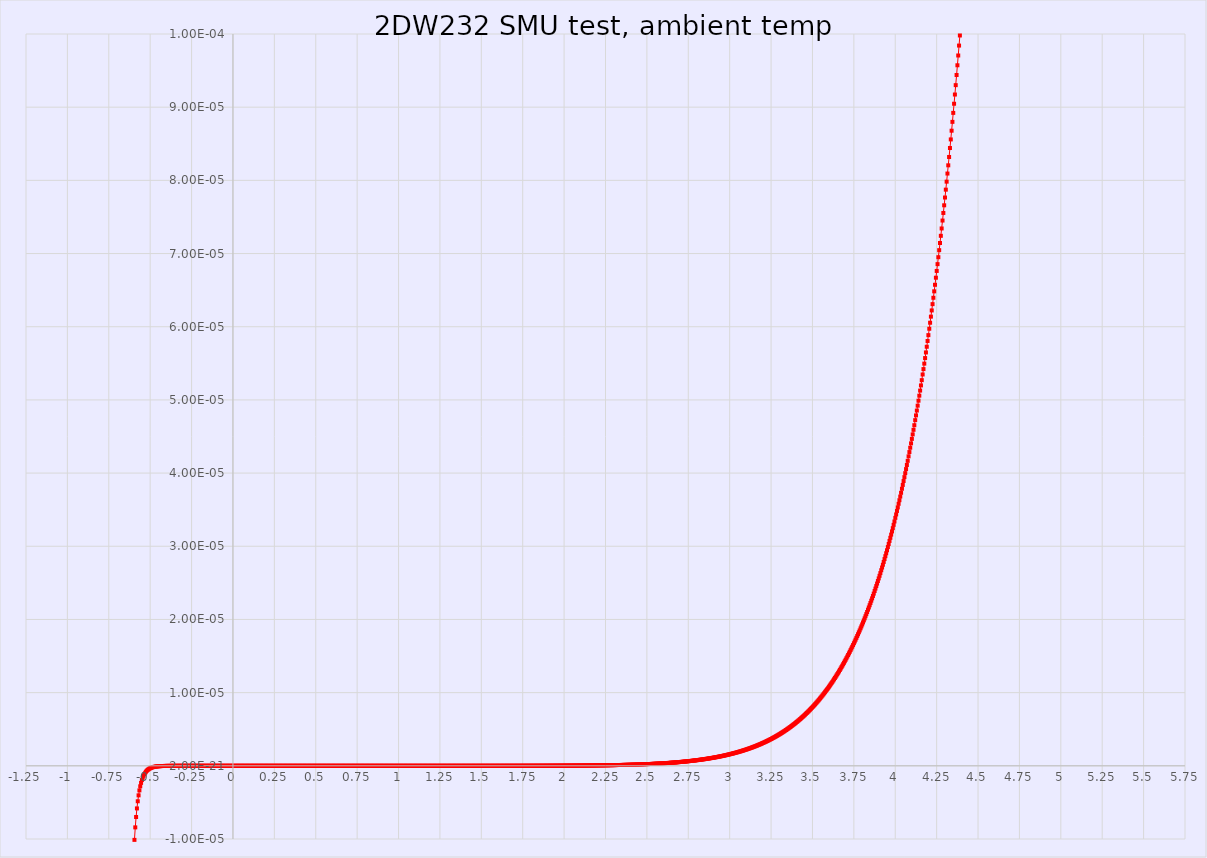
| Category | Series 0 |
|---|---|
| -0.812044 | -0.02 |
| -0.812034 | -0.02 |
| -0.81202 | -0.02 |
| -0.81203 | -0.02 |
| -0.812037 | -0.02 |
| -0.812029 | -0.02 |
| -0.81202 | -0.02 |
| -0.812019 | -0.02 |
| -0.812015 | -0.02 |
| -0.812009 | -0.02 |
| -0.812006 | -0.02 |
| -0.812006 | -0.02 |
| -0.812 | -0.02 |
| -0.811991 | -0.02 |
| -0.811995 | -0.02 |
| -0.811985 | -0.02 |
| -0.811979 | -0.02 |
| -0.811966 | -0.02 |
| -0.811964 | -0.02 |
| -0.811967 | -0.02 |
| -0.811957 | -0.02 |
| -0.811958 | -0.02 |
| -0.811951 | -0.02 |
| -0.811951 | -0.02 |
| -0.811946 | -0.02 |
| -0.811942 | -0.02 |
| -0.811942 | -0.02 |
| -0.811939 | -0.02 |
| -0.811934 | -0.02 |
| -0.811934 | -0.02 |
| -0.811929 | -0.02 |
| -0.811924 | -0.02 |
| -0.811926 | -0.02 |
| -0.811918 | -0.02 |
| -0.811916 | -0.02 |
| -0.811914 | -0.02 |
| -0.811904 | -0.02 |
| -0.811902 | -0.02 |
| -0.811893 | -0.02 |
| -0.811899 | -0.02 |
| -0.811892 | -0.02 |
| -0.811898 | -0.02 |
| -0.811895 | -0.02 |
| -0.811903 | -0.02 |
| -0.811891 | -0.02 |
| -0.811897 | -0.02 |
| -0.81189 | -0.02 |
| -0.81189 | -0.02 |
| -0.811886 | -0.02 |
| -0.811882 | -0.02 |
| -0.811879 | -0.02 |
| -0.81188 | -0.02 |
| -0.811876 | -0.02 |
| -0.811867 | -0.02 |
| -0.811857 | -0.02 |
| -0.811847 | -0.02 |
| -0.811858 | -0.02 |
| -0.81186 | -0.02 |
| -0.811858 | -0.02 |
| -0.811843 | -0.02 |
| -0.811852 | -0.02 |
| -0.811848 | -0.02 |
| -0.811845 | -0.02 |
| -0.811841 | -0.02 |
| -0.811819 | -0.02 |
| -0.811835 | -0.02 |
| -0.811845 | -0.02 |
| -0.811831 | -0.02 |
| -0.811834 | -0.02 |
| -0.811821 | -0.02 |
| -0.811821 | -0.02 |
| -0.811827 | -0.02 |
| -0.811806 | -0.02 |
| -0.811803 | -0.02 |
| -0.811808 | -0.02 |
| -0.811782 | -0.02 |
| -0.811775 | -0.02 |
| -0.811789 | -0.02 |
| -0.81179 | -0.02 |
| -0.811773 | -0.02 |
| -0.811769 | -0.02 |
| -0.811761 | -0.02 |
| -0.811759 | -0.02 |
| -0.811751 | -0.02 |
| -0.811757 | -0.02 |
| -0.811748 | -0.02 |
| -0.811746 | -0.02 |
| -0.81174 | -0.02 |
| -0.811735 | -0.02 |
| -0.811734 | -0.02 |
| -0.811723 | -0.02 |
| -0.811723 | -0.02 |
| -0.811722 | -0.02 |
| -0.811719 | -0.02 |
| -0.811712 | -0.02 |
| -0.811725 | -0.02 |
| -0.811718 | -0.02 |
| -0.811716 | -0.02 |
| -0.811719 | -0.02 |
| -0.811723 | -0.02 |
| -0.811723 | -0.02 |
| -0.811724 | -0.02 |
| -0.811731 | -0.02 |
| -0.811749 | -0.02 |
| -0.811738 | -0.02 |
| -0.811737 | -0.02 |
| -0.811732 | -0.02 |
| -0.811744 | -0.02 |
| -0.811734 | -0.02 |
| -0.811741 | -0.02 |
| -0.811724 | -0.02 |
| -0.811729 | -0.02 |
| -0.811726 | -0.02 |
| -0.811721 | -0.02 |
| -0.811725 | -0.02 |
| -0.811714 | -0.02 |
| -0.811728 | -0.02 |
| -0.811724 | -0.02 |
| -0.81172 | -0.02 |
| -0.811721 | -0.02 |
| -0.811723 | -0.02 |
| -0.811733 | -0.02 |
| -0.811728 | -0.02 |
| -0.811723 | -0.02 |
| -0.81171 | -0.02 |
| -0.811712 | -0.02 |
| -0.811715 | -0.02 |
| -0.811703 | -0.02 |
| -0.811701 | -0.02 |
| -0.811701 | -0.02 |
| -0.811697 | -0.02 |
| -0.811695 | -0.02 |
| -0.8117 | -0.02 |
| -0.811692 | -0.02 |
| -0.811685 | -0.02 |
| -0.811681 | -0.02 |
| -0.811682 | -0.02 |
| -0.811681 | -0.02 |
| -0.811682 | -0.02 |
| -0.811674 | -0.02 |
| -0.811667 | -0.02 |
| -0.811679 | -0.02 |
| -0.811664 | -0.02 |
| -0.811659 | -0.02 |
| -0.811659 | -0.02 |
| -0.811654 | -0.02 |
| -0.811659 | -0.02 |
| -0.811643 | -0.02 |
| -0.811645 | -0.02 |
| -0.811646 | -0.02 |
| -0.811647 | -0.02 |
| -0.811636 | -0.02 |
| -0.811643 | -0.02 |
| -0.811651 | -0.02 |
| -0.811641 | -0.02 |
| -0.811645 | -0.02 |
| -0.811647 | -0.02 |
| -0.811641 | -0.02 |
| -0.811642 | -0.02 |
| -0.811629 | -0.02 |
| -0.811629 | -0.02 |
| -0.811632 | -0.02 |
| -0.811637 | -0.02 |
| -0.811625 | -0.02 |
| -0.811626 | -0.02 |
| -0.81162 | -0.02 |
| -0.811629 | -0.02 |
| -0.811634 | -0.02 |
| -0.811625 | -0.02 |
| -0.811618 | -0.02 |
| -0.811612 | -0.02 |
| -0.811614 | -0.02 |
| -0.811611 | -0.02 |
| -0.811617 | -0.02 |
| -0.811626 | -0.02 |
| -0.811617 | -0.02 |
| -0.811618 | -0.02 |
| -0.811616 | -0.02 |
| -0.811627 | -0.02 |
| -0.811617 | -0.02 |
| -0.811624 | -0.02 |
| -0.811621 | -0.02 |
| -0.811628 | -0.02 |
| -0.811631 | -0.02 |
| -0.811634 | -0.02 |
| -0.811645 | -0.02 |
| -0.811653 | -0.02 |
| -0.811655 | -0.02 |
| -0.811667 | -0.02 |
| -0.811682 | -0.02 |
| -0.811702 | -0.02 |
| -0.811709 | -0.02 |
| -0.811729 | -0.02 |
| -0.811751 | -0.02 |
| -0.811752 | -0.02 |
| -0.811766 | -0.02 |
| -0.811775 | -0.02 |
| -0.811779 | -0.02 |
| -0.811782 | -0.02 |
| -0.811792 | -0.02 |
| -0.811805 | -0.02 |
| -0.81182 | -0.02 |
| -0.811823 | -0.02 |
| -0.811828 | -0.02 |
| -0.811843 | -0.02 |
| -0.811853 | -0.02 |
| -0.811859 | -0.02 |
| -0.811866 | -0.02 |
| -0.811879 | -0.02 |
| -0.811877 | -0.02 |
| -0.811869 | -0.02 |
| -0.811875 | -0.02 |
| -0.811878 | -0.02 |
| -0.811878 | -0.02 |
| -0.811889 | -0.02 |
| -0.811872 | -0.02 |
| -0.811881 | -0.02 |
| -0.811886 | -0.02 |
| -0.811879 | -0.02 |
| -0.811879 | -0.02 |
| -0.811893 | -0.02 |
| -0.811897 | -0.02 |
| -0.811903 | -0.02 |
| -0.811906 | -0.02 |
| -0.811905 | -0.02 |
| -0.811906 | -0.02 |
| -0.81191 | -0.02 |
| -0.811902 | -0.02 |
| -0.811904 | -0.02 |
| -0.811898 | -0.02 |
| -0.811897 | -0.02 |
| -0.811892 | -0.02 |
| -0.811883 | -0.02 |
| -0.811882 | -0.02 |
| -0.811886 | -0.02 |
| -0.811876 | -0.02 |
| -0.811871 | -0.02 |
| -0.811856 | -0.02 |
| -0.811865 | -0.02 |
| -0.81187 | -0.02 |
| -0.811878 | -0.02 |
| -0.811864 | -0.02 |
| -0.811881 | -0.02 |
| -0.811862 | -0.02 |
| -0.81187 | -0.02 |
| -0.811863 | -0.02 |
| -0.811857 | -0.02 |
| -0.81185 | -0.02 |
| -0.811856 | -0.02 |
| -0.811855 | -0.02 |
| -0.81186 | -0.02 |
| -0.811846 | -0.02 |
| -0.811847 | -0.02 |
| -0.811841 | -0.02 |
| -0.811853 | -0.02 |
| -0.811846 | -0.02 |
| -0.811835 | -0.02 |
| -0.811841 | -0.02 |
| -0.811848 | -0.02 |
| -0.81183 | -0.02 |
| -0.811845 | -0.02 |
| -0.811836 | -0.02 |
| -0.811843 | -0.02 |
| -0.811844 | -0.02 |
| -0.811837 | -0.02 |
| -0.81184 | -0.02 |
| -0.81184 | -0.02 |
| -0.811846 | -0.02 |
| -0.81183 | -0.02 |
| -0.811843 | -0.02 |
| -0.811827 | -0.02 |
| -0.811825 | -0.02 |
| -0.811829 | -0.02 |
| -0.811827 | -0.02 |
| -0.811806 | -0.02 |
| -0.811796 | -0.02 |
| -0.81181 | -0.02 |
| -0.811791 | -0.02 |
| -0.811787 | -0.02 |
| -0.811779 | -0.02 |
| -0.811773 | -0.02 |
| -0.811777 | -0.02 |
| -0.811773 | -0.02 |
| -0.811767 | -0.02 |
| -0.811766 | -0.02 |
| -0.811759 | -0.02 |
| -0.811762 | -0.02 |
| -0.811754 | -0.02 |
| -0.811743 | -0.02 |
| -0.811752 | -0.02 |
| -0.811733 | -0.02 |
| -0.811735 | -0.02 |
| -0.811733 | -0.02 |
| -0.811727 | -0.02 |
| -0.81172 | -0.02 |
| -0.811727 | -0.02 |
| -0.811719 | -0.02 |
| -0.81173 | -0.02 |
| -0.811735 | -0.02 |
| -0.811728 | -0.02 |
| -0.811713 | -0.02 |
| -0.811713 | -0.02 |
| -0.811698 | -0.02 |
| -0.811709 | -0.02 |
| -0.811707 | -0.02 |
| -0.811698 | -0.02 |
| -0.811693 | -0.02 |
| -0.811703 | -0.02 |
| -0.811693 | -0.02 |
| -0.811692 | -0.02 |
| -0.811684 | -0.02 |
| -0.811682 | -0.02 |
| -0.811669 | -0.02 |
| -0.811669 | -0.02 |
| -0.811659 | -0.02 |
| -0.811658 | -0.02 |
| -0.811663 | -0.02 |
| -0.811664 | -0.02 |
| -0.811662 | -0.02 |
| -0.811659 | -0.02 |
| -0.811661 | -0.02 |
| -0.81165 | -0.02 |
| -0.811656 | -0.02 |
| -0.811657 | -0.02 |
| -0.81166 | -0.02 |
| -0.811657 | -0.02 |
| -0.811653 | -0.02 |
| -0.811657 | -0.02 |
| -0.811663 | -0.02 |
| -0.811662 | -0.02 |
| -0.811662 | -0.02 |
| -0.811654 | -0.02 |
| -0.811664 | -0.02 |
| -0.811662 | -0.02 |
| -0.811655 | -0.02 |
| -0.811656 | -0.02 |
| -0.811663 | -0.02 |
| -0.811661 | -0.02 |
| -0.811656 | -0.02 |
| -0.811641 | -0.02 |
| -0.81166 | -0.02 |
| -0.811645 | -0.02 |
| -0.811654 | -0.02 |
| -0.811653 | -0.02 |
| -0.811649 | -0.02 |
| -0.811649 | -0.02 |
| -0.811649 | -0.02 |
| -0.811645 | -0.02 |
| -0.811659 | -0.02 |
| -0.811653 | -0.02 |
| -0.811654 | -0.02 |
| -0.811662 | -0.02 |
| -0.81166 | -0.02 |
| -0.811669 | -0.02 |
| -0.811674 | -0.02 |
| -0.811678 | -0.02 |
| -0.811683 | -0.02 |
| -0.811678 | -0.02 |
| -0.811682 | -0.02 |
| -0.811688 | -0.02 |
| -0.811689 | -0.02 |
| -0.811687 | -0.02 |
| -0.81169 | -0.02 |
| -0.811685 | -0.02 |
| -0.811684 | -0.02 |
| -0.811678 | -0.02 |
| -0.811679 | -0.02 |
| -0.811673 | -0.02 |
| -0.811674 | -0.02 |
| -0.811669 | -0.02 |
| -0.811659 | -0.02 |
| -0.811664 | -0.02 |
| -0.811654 | -0.02 |
| -0.81166 | -0.02 |
| -0.81165 | -0.02 |
| -0.811664 | -0.02 |
| -0.81165 | -0.02 |
| -0.811659 | -0.02 |
| -0.811651 | -0.02 |
| -0.811645 | -0.02 |
| -0.811638 | -0.02 |
| -0.81165 | -0.02 |
| -0.811627 | -0.02 |
| -0.811634 | -0.02 |
| -0.811638 | -0.02 |
| -0.811633 | -0.02 |
| -0.811627 | -0.02 |
| -0.811617 | -0.02 |
| -0.811627 | -0.02 |
| -0.811631 | -0.02 |
| -0.811628 | -0.02 |
| -0.811612 | -0.02 |
| -0.811614 | -0.02 |
| -0.811622 | -0.02 |
| -0.811613 | -0.02 |
| -0.811616 | -0.02 |
| -0.811607 | -0.02 |
| -0.811607 | -0.02 |
| -0.811605 | -0.02 |
| -0.811596 | -0.02 |
| -0.811588 | -0.02 |
| -0.811594 | -0.02 |
| -0.811594 | -0.02 |
| -0.811582 | -0.02 |
| -0.81159 | -0.02 |
| -0.811581 | -0.02 |
| -0.811582 | -0.02 |
| -0.811577 | -0.02 |
| -0.811581 | -0.02 |
| -0.811574 | -0.02 |
| -0.81158 | -0.02 |
| -0.811569 | -0.02 |
| -0.81156 | -0.02 |
| -0.811545 | -0.02 |
| -0.811551 | -0.02 |
| -0.811545 | -0.02 |
| -0.811537 | -0.02 |
| -0.81154 | -0.02 |
| -0.811536 | -0.02 |
| -0.811539 | -0.02 |
| -0.81153 | -0.02 |
| -0.811525 | -0.02 |
| -0.811518 | -0.02 |
| -0.811528 | -0.02 |
| -0.811517 | -0.02 |
| -0.811518 | -0.02 |
| -0.811507 | -0.02 |
| -0.811504 | -0.02 |
| -0.811497 | -0.02 |
| -0.811498 | -0.02 |
| -0.811494 | -0.02 |
| -0.811494 | -0.02 |
| -0.811488 | -0.02 |
| -0.811485 | -0.02 |
| -0.811486 | -0.02 |
| -0.811478 | -0.02 |
| -0.811474 | -0.02 |
| -0.811473 | -0.02 |
| -0.811472 | -0.02 |
| -0.811459 | -0.02 |
| -0.811468 | -0.02 |
| -0.811467 | -0.02 |
| -0.811459 | -0.02 |
| -0.811466 | -0.02 |
| -0.811471 | -0.02 |
| -0.811469 | -0.02 |
| -0.81147 | -0.02 |
| -0.81146 | -0.02 |
| -0.811463 | -0.02 |
| -0.811459 | -0.02 |
| -0.811439 | -0.02 |
| -0.811439 | -0.02 |
| -0.811455 | -0.02 |
| -0.811454 | -0.02 |
| -0.811457 | -0.02 |
| -0.811449 | -0.02 |
| -0.811441 | -0.02 |
| -0.811447 | -0.02 |
| -0.81145 | -0.02 |
| -0.811445 | -0.02 |
| -0.811437 | -0.02 |
| -0.811445 | -0.02 |
| -0.81144 | -0.02 |
| -0.811423 | -0.02 |
| -0.811437 | -0.02 |
| -0.811434 | -0.02 |
| -0.811438 | -0.02 |
| -0.811428 | -0.02 |
| -0.811438 | -0.02 |
| -0.811439 | -0.02 |
| -0.811433 | -0.02 |
| -0.811437 | -0.02 |
| -0.811437 | -0.02 |
| -0.811445 | -0.02 |
| -0.811446 | -0.02 |
| -0.811453 | -0.02 |
| -0.811442 | -0.02 |
| -0.811449 | -0.02 |
| -0.811451 | -0.02 |
| -0.811449 | -0.02 |
| -0.811454 | -0.02 |
| -0.811446 | -0.02 |
| -0.811446 | -0.02 |
| -0.811436 | -0.02 |
| -0.811452 | -0.02 |
| -0.811438 | -0.02 |
| -0.811438 | -0.02 |
| -0.811436 | -0.02 |
| -0.811446 | -0.02 |
| -0.811437 | -0.02 |
| -0.811451 | -0.02 |
| -0.811463 | -0.02 |
| -0.811456 | -0.02 |
| -0.811465 | -0.02 |
| -0.811476 | -0.02 |
| -0.811475 | -0.02 |
| -0.811475 | -0.02 |
| -0.811483 | -0.02 |
| -0.811481 | -0.02 |
| -0.811471 | -0.02 |
| -0.811477 | -0.02 |
| -0.811474 | -0.02 |
| -0.811482 | -0.02 |
| -0.811471 | -0.02 |
| -0.811457 | -0.02 |
| -0.811462 | -0.02 |
| -0.811452 | -0.02 |
| -0.811456 | -0.02 |
| -0.811446 | -0.02 |
| -0.811455 | -0.02 |
| -0.811443 | -0.02 |
| -0.811445 | -0.02 |
| -0.811437 | -0.02 |
| -0.811433 | -0.02 |
| -0.811426 | -0.02 |
| -0.811427 | -0.02 |
| -0.811422 | -0.02 |
| -0.811413 | -0.02 |
| -0.81141 | -0.02 |
| -0.811402 | -0.02 |
| -0.8114 | -0.02 |
| -0.8114 | -0.02 |
| -0.811397 | -0.02 |
| -0.8114 | -0.02 |
| -0.811394 | -0.02 |
| -0.811379 | -0.02 |
| -0.811387 | -0.02 |
| -0.811371 | -0.02 |
| -0.811382 | -0.02 |
| -0.81138 | -0.02 |
| -0.811374 | -0.02 |
| -0.811373 | -0.02 |
| -0.811369 | -0.02 |
| -0.811365 | -0.02 |
| -0.811371 | -0.02 |
| -0.811371 | -0.02 |
| -0.811363 | -0.02 |
| -0.811361 | -0.02 |
| -0.811366 | -0.02 |
| -0.811359 | -0.02 |
| -0.81136 | -0.02 |
| -0.81135 | -0.02 |
| -0.811341 | -0.02 |
| -0.811347 | -0.02 |
| -0.811344 | -0.02 |
| -0.811335 | -0.02 |
| -0.811323 | -0.02 |
| -0.811335 | -0.02 |
| -0.811328 | -0.02 |
| -0.811334 | -0.02 |
| -0.81133 | -0.02 |
| -0.811333 | -0.02 |
| -0.811318 | -0.02 |
| -0.811313 | -0.02 |
| -0.811317 | -0.02 |
| -0.811313 | -0.02 |
| -0.811319 | -0.02 |
| -0.811306 | -0.02 |
| -0.811299 | -0.02 |
| -0.811297 | -0.02 |
| -0.811282 | -0.02 |
| -0.811288 | -0.02 |
| -0.811283 | -0.02 |
| -0.811281 | -0.02 |
| -0.811273 | -0.02 |
| -0.811272 | -0.02 |
| -0.811265 | -0.02 |
| -0.811268 | -0.02 |
| -0.811263 | -0.02 |
| -0.811249 | -0.02 |
| -0.811261 | -0.02 |
| -0.811248 | -0.02 |
| -0.811239 | -0.02 |
| -0.811241 | -0.02 |
| -0.811241 | -0.02 |
| -0.811244 | -0.02 |
| -0.811235 | -0.02 |
| -0.811251 | -0.02 |
| -0.81125 | -0.02 |
| -0.811251 | -0.02 |
| -0.811257 | -0.02 |
| -0.81126 | -0.02 |
| -0.811267 | -0.02 |
| -0.811266 | -0.02 |
| -0.81126 | -0.02 |
| -0.811262 | -0.02 |
| -0.811267 | -0.02 |
| -0.811265 | -0.02 |
| -0.811259 | -0.02 |
| -0.811273 | -0.02 |
| -0.811288 | -0.02 |
| -0.811276 | -0.02 |
| -0.811284 | -0.02 |
| -0.811284 | -0.02 |
| -0.811287 | -0.02 |
| -0.811289 | -0.02 |
| -0.811288 | -0.02 |
| -0.811277 | -0.02 |
| -0.811288 | -0.02 |
| -0.811271 | -0.02 |
| -0.811274 | -0.02 |
| -0.811276 | -0.02 |
| -0.81128 | -0.02 |
| -0.811278 | -0.02 |
| -0.811277 | -0.02 |
| -0.811284 | -0.02 |
| -0.811293 | -0.02 |
| -0.811297 | -0.02 |
| -0.811292 | -0.02 |
| -0.811294 | -0.02 |
| -0.8113 | -0.02 |
| -0.811302 | -0.02 |
| -0.811305 | -0.02 |
| -0.811308 | -0.02 |
| -0.811308 | -0.02 |
| -0.811305 | -0.02 |
| -0.811307 | -0.02 |
| -0.811305 | -0.02 |
| -0.811313 | -0.02 |
| -0.811322 | -0.02 |
| -0.811321 | -0.02 |
| -0.811323 | -0.02 |
| -0.811319 | -0.02 |
| -0.811328 | -0.02 |
| -0.811328 | -0.02 |
| -0.811337 | -0.02 |
| -0.811318 | -0.02 |
| -0.811316 | -0.02 |
| -0.811328 | -0.02 |
| -0.81132 | -0.02 |
| -0.811316 | -0.02 |
| -0.81132 | -0.02 |
| -0.81132 | -0.02 |
| -0.811322 | -0.02 |
| -0.811325 | -0.02 |
| -0.811329 | -0.02 |
| -0.811315 | -0.02 |
| -0.811311 | -0.02 |
| -0.811318 | -0.02 |
| -0.811311 | -0.02 |
| -0.811316 | -0.02 |
| -0.811308 | -0.02 |
| -0.811322 | -0.02 |
| -0.81131 | -0.02 |
| -0.811305 | -0.02 |
| -0.811305 | -0.02 |
| -0.811296 | -0.02 |
| -0.811285 | -0.02 |
| -0.811294 | -0.02 |
| -0.811289 | -0.02 |
| -0.811282 | -0.02 |
| -0.811286 | -0.02 |
| -0.811288 | -0.02 |
| -0.811276 | -0.02 |
| -0.811267 | -0.02 |
| -0.811276 | -0.02 |
| -0.811266 | -0.02 |
| -0.811269 | -0.02 |
| -0.811265 | -0.02 |
| -0.811259 | -0.02 |
| -0.811263 | -0.02 |
| -0.811262 | -0.02 |
| -0.811256 | -0.02 |
| -0.811251 | -0.02 |
| -0.81125 | -0.02 |
| -0.811243 | -0.02 |
| -0.811249 | -0.02 |
| -0.811241 | -0.02 |
| -0.811242 | -0.02 |
| -0.811238 | -0.02 |
| -0.811233 | -0.02 |
| -0.811226 | -0.02 |
| -0.811222 | -0.02 |
| -0.811228 | -0.02 |
| -0.81123 | -0.02 |
| -0.811236 | -0.02 |
| -0.811228 | -0.02 |
| -0.81123 | -0.02 |
| -0.811225 | -0.02 |
| -0.811223 | -0.02 |
| -0.81124 | -0.02 |
| -0.811219 | -0.02 |
| -0.811224 | -0.02 |
| -0.811225 | -0.02 |
| -0.811223 | -0.02 |
| -0.811223 | -0.02 |
| -0.811224 | -0.02 |
| -0.811229 | -0.02 |
| -0.811226 | -0.02 |
| -0.811223 | -0.02 |
| -0.811223 | -0.02 |
| -0.811216 | -0.02 |
| -0.811216 | -0.02 |
| -0.811227 | -0.02 |
| -0.81122 | -0.02 |
| -0.811218 | -0.02 |
| -0.811215 | -0.02 |
| -0.811217 | -0.02 |
| -0.81122 | -0.02 |
| -0.811207 | -0.02 |
| -0.811196 | -0.02 |
| -0.811196 | -0.02 |
| -0.811186 | -0.02 |
| -0.811182 | -0.02 |
| -0.811185 | -0.02 |
| -0.811181 | -0.02 |
| -0.811179 | -0.02 |
| -0.811176 | -0.02 |
| -0.811175 | -0.02 |
| -0.811166 | -0.02 |
| -0.811157 | -0.02 |
| -0.811163 | -0.02 |
| -0.811147 | -0.02 |
| -0.811161 | -0.02 |
| -0.811159 | -0.02 |
| -0.811163 | -0.02 |
| -0.811156 | -0.02 |
| -0.811153 | -0.02 |
| -0.811135 | -0.02 |
| -0.811146 | -0.02 |
| -0.81115 | -0.02 |
| -0.811134 | -0.02 |
| -0.811144 | -0.02 |
| -0.811131 | -0.02 |
| -0.811136 | -0.02 |
| -0.811128 | -0.02 |
| -0.811133 | -0.02 |
| -0.811134 | -0.02 |
| -0.811142 | -0.02 |
| -0.81114 | -0.02 |
| -0.81115 | -0.02 |
| -0.811134 | -0.02 |
| -0.811136 | -0.02 |
| -0.811148 | -0.02 |
| -0.811155 | -0.02 |
| -0.811147 | -0.02 |
| -0.811155 | -0.02 |
| -0.811147 | -0.02 |
| -0.811142 | -0.02 |
| -0.811151 | -0.02 |
| -0.811146 | -0.02 |
| -0.811144 | -0.02 |
| -0.811148 | -0.02 |
| -0.811141 | -0.02 |
| -0.81114 | -0.02 |
| -0.811143 | -0.02 |
| -0.811146 | -0.02 |
| -0.811141 | -0.02 |
| -0.811144 | -0.02 |
| -0.81114 | -0.02 |
| -0.811135 | -0.02 |
| -0.811135 | -0.02 |
| -0.811145 | -0.02 |
| -0.811148 | -0.02 |
| -0.811146 | -0.02 |
| -0.811146 | -0.02 |
| -0.811142 | -0.02 |
| -0.811154 | -0.02 |
| -0.811157 | -0.02 |
| -0.811164 | -0.02 |
| -0.811171 | -0.02 |
| -0.811176 | -0.02 |
| -0.811176 | -0.02 |
| -0.811192 | -0.02 |
| -0.811191 | -0.02 |
| -0.811183 | -0.02 |
| -0.81119 | -0.02 |
| -0.811198 | -0.02 |
| -0.811201 | -0.02 |
| -0.811198 | -0.02 |
| -0.811195 | -0.02 |
| -0.811206 | -0.02 |
| -0.81121 | -0.02 |
| -0.811204 | -0.02 |
| -0.8112 | -0.02 |
| -0.811214 | -0.02 |
| -0.811197 | -0.02 |
| -0.811199 | -0.02 |
| -0.811201 | -0.02 |
| -0.811201 | -0.02 |
| -0.811214 | -0.02 |
| -0.811204 | -0.02 |
| -0.811205 | -0.02 |
| -0.811195 | -0.02 |
| -0.811201 | -0.02 |
| -0.811201 | -0.02 |
| -0.811203 | -0.02 |
| -0.811194 | -0.02 |
| -0.811202 | -0.02 |
| -0.811191 | -0.02 |
| -0.811196 | -0.02 |
| -0.811194 | -0.02 |
| -0.811185 | -0.02 |
| -0.811184 | -0.02 |
| -0.811187 | -0.02 |
| -0.811178 | -0.02 |
| -0.811172 | -0.02 |
| -0.811172 | -0.02 |
| -0.811175 | -0.02 |
| -0.81117 | -0.02 |
| -0.811172 | -0.02 |
| -0.811169 | -0.02 |
| -0.811149 | -0.02 |
| -0.811156 | -0.02 |
| -0.811153 | -0.02 |
| -0.811151 | -0.02 |
| -0.811143 | -0.02 |
| -0.811156 | -0.02 |
| -0.811149 | -0.02 |
| -0.811143 | -0.02 |
| -0.811143 | -0.02 |
| -0.81115 | -0.02 |
| -0.811148 | -0.02 |
| -0.811148 | -0.02 |
| -0.81114 | -0.02 |
| -0.811143 | -0.02 |
| -0.811129 | -0.02 |
| -0.811135 | -0.02 |
| -0.81114 | -0.02 |
| -0.811134 | -0.02 |
| -0.811144 | -0.02 |
| -0.811135 | -0.02 |
| -0.811147 | -0.02 |
| -0.811146 | -0.02 |
| -0.811135 | -0.02 |
| -0.811138 | -0.02 |
| -0.811133 | -0.02 |
| -0.81114 | -0.02 |
| -0.811136 | -0.02 |
| -0.811132 | -0.02 |
| -0.81113 | -0.02 |
| -0.811119 | -0.02 |
| -0.811116 | -0.02 |
| -0.811115 | -0.02 |
| -0.811108 | -0.02 |
| -0.811114 | -0.02 |
| -0.811112 | -0.02 |
| -0.811098 | -0.02 |
| -0.811101 | -0.02 |
| -0.811093 | -0.02 |
| -0.811101 | -0.02 |
| -0.811093 | -0.02 |
| -0.811099 | -0.02 |
| -0.811092 | -0.02 |
| -0.8111 | -0.02 |
| -0.811087 | -0.02 |
| -0.811087 | -0.02 |
| -0.811086 | -0.02 |
| -0.811083 | -0.02 |
| -0.811088 | -0.02 |
| -0.81108 | -0.02 |
| -0.811074 | -0.02 |
| -0.81107 | -0.02 |
| -0.811087 | -0.02 |
| -0.81108 | -0.02 |
| -0.811074 | -0.02 |
| -0.811075 | -0.02 |
| -0.811083 | -0.02 |
| -0.811082 | -0.02 |
| -0.811074 | -0.02 |
| -0.811078 | -0.02 |
| -0.811075 | -0.02 |
| -0.811078 | -0.02 |
| -0.811082 | -0.02 |
| -0.811078 | -0.02 |
| -0.811088 | -0.02 |
| -0.811098 | -0.02 |
| -0.811096 | -0.02 |
| -0.811097 | -0.02 |
| -0.811094 | -0.02 |
| -0.811101 | -0.02 |
| -0.811098 | -0.02 |
| -0.811099 | -0.02 |
| -0.811091 | -0.02 |
| -0.811089 | -0.02 |
| -0.811088 | -0.02 |
| -0.811082 | -0.02 |
| -0.811089 | -0.02 |
| -0.811072 | -0.02 |
| -0.811078 | -0.02 |
| -0.811077 | -0.02 |
| -0.811076 | -0.02 |
| -0.81108 | -0.02 |
| -0.811063 | -0.02 |
| -0.811063 | -0.02 |
| -0.811048 | -0.02 |
| -0.811054 | -0.02 |
| -0.81105 | -0.02 |
| -0.811049 | -0.02 |
| -0.811044 | -0.02 |
| -0.811042 | -0.02 |
| -0.81104 | -0.02 |
| -0.811039 | -0.02 |
| -0.81103 | -0.02 |
| -0.811031 | -0.02 |
| -0.811021 | -0.02 |
| -0.811019 | -0.02 |
| -0.811021 | -0.02 |
| -0.81102 | -0.02 |
| -0.811016 | -0.02 |
| -0.811017 | -0.02 |
| -0.811021 | -0.02 |
| -0.811016 | -0.02 |
| -0.811012 | -0.02 |
| -0.811008 | -0.02 |
| -0.810995 | -0.02 |
| -0.810998 | -0.02 |
| -0.810995 | -0.02 |
| -0.810996 | -0.02 |
| -0.811 | -0.02 |
| -0.810999 | -0.02 |
| -0.811 | -0.02 |
| -0.810995 | -0.02 |
| -0.810995 | -0.02 |
| -0.810993 | -0.02 |
| -0.810986 | -0.02 |
| -0.810994 | -0.02 |
| -0.810992 | -0.02 |
| -0.810985 | -0.02 |
| -0.810992 | -0.02 |
| -0.810981 | -0.02 |
| -0.810972 | -0.02 |
| -0.810984 | -0.02 |
| -0.810977 | -0.02 |
| -0.810976 | -0.02 |
| -0.810987 | -0.02 |
| -0.810989 | -0.02 |
| -0.810981 | -0.02 |
| -0.810987 | -0.02 |
| -0.810979 | -0.02 |
| -0.810972 | -0.02 |
| -0.810972 | -0.02 |
| -0.810976 | -0.02 |
| -0.810974 | -0.02 |
| -0.81097 | -0.02 |
| -0.810971 | -0.02 |
| -0.810974 | -0.02 |
| -0.810976 | -0.02 |
| -0.810976 | -0.02 |
| -0.810975 | -0.02 |
| -0.810967 | -0.02 |
| -0.81097 | -0.02 |
| -0.810984 | -0.02 |
| -0.810981 | -0.02 |
| -0.810983 | -0.02 |
| -0.810971 | -0.02 |
| -0.810979 | -0.02 |
| -0.810981 | -0.02 |
| -0.810971 | -0.02 |
| -0.810975 | -0.02 |
| -0.810967 | -0.02 |
| -0.81097 | -0.02 |
| -0.810962 | -0.02 |
| -0.810968 | -0.02 |
| -0.81096 | -0.02 |
| -0.810967 | -0.02 |
| -0.810971 | -0.02 |
| -0.810971 | -0.02 |
| -0.810971 | -0.02 |
| -0.810975 | -0.02 |
| -0.810968 | -0.02 |
| -0.810967 | -0.02 |
| -0.810979 | -0.02 |
| -0.810967 | -0.02 |
| -0.810971 | -0.02 |
| -0.810976 | -0.02 |
| -0.810976 | -0.02 |
| -0.810977 | -0.02 |
| -0.810973 | -0.02 |
| -0.810952 | -0.02 |
| -0.810963 | -0.02 |
| -0.810959 | -0.02 |
| -0.810959 | -0.02 |
| -0.810952 | -0.02 |
| -0.810957 | -0.02 |
| -0.810964 | -0.02 |
| -0.81097 | -0.02 |
| -0.810959 | -0.02 |
| -0.810974 | -0.02 |
| -0.810962 | -0.02 |
| -0.81097 | -0.02 |
| -0.810962 | -0.02 |
| -0.810948 | -0.02 |
| -0.810951 | -0.02 |
| -0.810954 | -0.02 |
| -0.810955 | -0.02 |
| -0.810949 | -0.02 |
| -0.810954 | -0.02 |
| -0.810946 | -0.02 |
| -0.810941 | -0.02 |
| -0.810933 | -0.02 |
| -0.810927 | -0.02 |
| -0.810944 | -0.02 |
| -0.810932 | -0.02 |
| -0.810937 | -0.02 |
| -0.810945 | -0.02 |
| -0.810949 | -0.02 |
| -0.810951 | -0.02 |
| -0.810948 | -0.02 |
| -0.810953 | -0.02 |
| -0.810952 | -0.02 |
| -0.810944 | -0.02 |
| -0.810951 | -0.02 |
| -0.810952 | -0.02 |
| -0.810948 | -0.02 |
| -0.810953 | -0.02 |
| -0.810948 | -0.02 |
| -0.81095 | -0.02 |
| -0.810954 | -0.02 |
| -0.810962 | -0.02 |
| -0.810965 | -0.02 |
| -0.810962 | -0.02 |
| -0.810967 | -0.02 |
| -0.810965 | -0.02 |
| -0.810965 | -0.02 |
| -0.81098 | -0.02 |
| -0.810981 | -0.02 |
| -0.810979 | -0.02 |
| -0.810975 | -0.02 |
| -0.810977 | -0.02 |
| -0.810976 | -0.02 |
| -0.810981 | -0.02 |
| -0.810985 | -0.02 |
| -0.81098 | -0.02 |
| -0.810972 | -0.02 |
| -0.810974 | -0.02 |
| -0.810983 | -0.02 |
| -0.810976 | -0.02 |
| -0.810974 | -0.02 |
| -0.810986 | -0.02 |
| -0.810977 | -0.02 |
| -0.810976 | -0.02 |
| -0.810979 | -0.02 |
| -0.810979 | -0.02 |
| -0.810988 | -0.02 |
| -0.81098 | -0.02 |
| -0.810979 | -0.02 |
| -0.810967 | -0.02 |
| -0.810966 | -0.02 |
| -0.810962 | -0.02 |
| -0.810966 | -0.02 |
| -0.810955 | -0.02 |
| -0.810952 | -0.02 |
| -0.810956 | -0.02 |
| -0.810956 | -0.02 |
| -0.810939 | -0.02 |
| -0.810943 | -0.02 |
| -0.810933 | -0.02 |
| -0.810934 | -0.02 |
| -0.810941 | -0.02 |
| -0.810937 | -0.02 |
| -0.810947 | -0.02 |
| -0.810934 | -0.02 |
| -0.810932 | -0.02 |
| -0.810939 | -0.02 |
| -0.810937 | -0.02 |
| -0.810934 | -0.02 |
| -0.810936 | -0.02 |
| -0.810936 | -0.02 |
| -0.810943 | -0.02 |
| -0.810934 | -0.02 |
| -0.810935 | -0.02 |
| -0.810925 | -0.02 |
| -0.810929 | -0.02 |
| -0.810935 | -0.02 |
| -0.810923 | -0.02 |
| -0.810923 | -0.02 |
| -0.810918 | -0.02 |
| -0.810902 | -0.02 |
| -0.810915 | -0.02 |
| -0.810907 | -0.02 |
| -0.810905 | -0.02 |
| -0.810905 | -0.02 |
| -0.810895 | -0.02 |
| -0.810904 | -0.02 |
| -0.810898 | -0.02 |
| -0.810902 | -0.02 |
| -0.810895 | -0.02 |
| -0.810909 | -0.02 |
| -0.810909 | -0.02 |
| -0.810915 | -0.02 |
| -0.810919 | -0.02 |
| -0.810928 | -0.02 |
| -0.810948 | -0.02 |
| -0.810948 | -0.02 |
| -0.810957 | -0.02 |
| -0.81097 | -0.02 |
| -0.810966 | -0.02 |
| -0.810974 | -0.02 |
| -0.810986 | -0.02 |
| -0.810993 | -0.02 |
| -0.810993 | -0.02 |
| -0.810998 | -0.02 |
| -0.811005 | -0.02 |
| -0.810992 | -0.02 |
| -0.810994 | -0.02 |
| -0.810999 | -0.02 |
| -0.811 | -0.02 |
| -0.81101 | -0.02 |
| -0.811017 | -0.02 |
| -0.811016 | -0.02 |
| -0.811017 | -0.02 |
| -0.811041 | -0.02 |
| -0.811036 | -0.02 |
| -0.811043 | -0.02 |
| -0.811055 | -0.02 |
| -0.811053 | -0.02 |
| -0.811066 | -0.02 |
| -0.811075 | -0.02 |
| -0.811073 | -0.02 |
| -0.811073 | -0.02 |
| -0.811086 | -0.02 |
| -0.811102 | -0.02 |
| -0.81111 | -0.02 |
| -0.81111 | -0.02 |
| -0.81111 | -0.02 |
| -0.8111 | -0.02 |
| -0.811113 | -0.02 |
| -0.811101 | -0.02 |
| -0.811096 | -0.02 |
| -0.811096 | -0.02 |
| -0.811094 | -0.02 |
| -0.811104 | -0.02 |
| -0.811087 | -0.02 |
| -0.811091 | -0.02 |
| -0.811088 | -0.02 |
| -0.811079 | -0.02 |
| -0.811077 | -0.02 |
| -0.81108 | -0.02 |
| -0.811073 | -0.02 |
| -0.811076 | -0.02 |
| -0.811076 | -0.02 |
| -0.811087 | -0.02 |
| -0.811082 | -0.02 |
| -0.811088 | -0.02 |
| -0.811087 | -0.02 |
| -0.81108 | -0.02 |
| -0.81109 | -0.02 |
| -0.811077 | -0.02 |
| -0.811094 | -0.02 |
| -0.811087 | -0.02 |
| -0.81109 | -0.02 |
| -0.811082 | -0.02 |
| -0.811094 | -0.02 |
| -0.811097 | -0.02 |
| -0.811091 | -0.02 |
| -0.811096 | -0.02 |
| -0.811085 | -0.02 |
| -0.811083 | -0.02 |
| -0.811086 | -0.02 |
| -0.811081 | -0.02 |
| -0.811083 | -0.02 |
| -0.811087 | -0.02 |
| -0.811091 | -0.02 |
| -0.811085 | -0.02 |
| -0.811087 | -0.02 |
| -0.811085 | -0.02 |
| -0.811095 | -0.02 |
| -0.811088 | -0.02 |
| -0.811093 | -0.02 |
| -0.811086 | -0.02 |
| -0.811104 | -0.02 |
| -0.81109 | -0.02 |
| -0.811099 | -0.02 |
| -0.811099 | -0.02 |
| -0.811111 | -0.02 |
| -0.811116 | -0.02 |
| -0.811104 | -0.02 |
| -0.811116 | -0.02 |
| -0.811117 | -0.02 |
| -0.811121 | -0.02 |
| -0.811129 | -0.02 |
| -0.811127 | -0.02 |
| -0.811126 | -0.02 |
| -0.81114 | -0.02 |
| -0.811134 | -0.02 |
| -0.81114 | -0.02 |
| -0.811139 | -0.02 |
| -0.81114 | -0.02 |
| -0.811142 | -0.02 |
| -0.811126 | -0.02 |
| -0.811141 | -0.02 |
| -0.811139 | -0.02 |
| -0.811154 | -0.02 |
| -0.811159 | -0.02 |
| -0.811166 | -0.02 |
| -0.811162 | -0.02 |
| -0.811174 | -0.02 |
| -0.811172 | -0.02 |
| -0.81118 | -0.02 |
| -0.811185 | -0.02 |
| -0.811183 | -0.02 |
| -0.811188 | -0.02 |
| -0.811189 | -0.02 |
| -0.811189 | -0.02 |
| -0.811188 | -0.02 |
| -0.811206 | -0.02 |
| -0.811198 | -0.02 |
| -0.811203 | -0.02 |
| -0.811208 | -0.02 |
| -0.811208 | -0.02 |
| -0.811213 | -0.02 |
| -0.811223 | -0.02 |
| -0.811229 | -0.02 |
| -0.81123 | -0.02 |
| -0.811233 | -0.02 |
| -0.811235 | -0.02 |
| -0.811232 | -0.02 |
| -0.811221 | -0.02 |
| -0.811232 | -0.02 |
| -0.811216 | -0.02 |
| -0.811228 | -0.02 |
| -0.811237 | -0.02 |
| -0.811232 | -0.02 |
| -0.811234 | -0.02 |
| -0.811225 | -0.02 |
| -0.811225 | -0.02 |
| -0.811228 | -0.02 |
| -0.811238 | -0.02 |
| -0.811237 | -0.02 |
| -0.81123 | -0.02 |
| -0.81123 | -0.02 |
| -0.811234 | -0.02 |
| -0.811238 | -0.02 |
| -0.811235 | -0.02 |
| -0.811242 | -0.02 |
| -0.811237 | -0.02 |
| -0.811245 | -0.02 |
| -0.811245 | -0.02 |
| -0.81124 | -0.02 |
| -0.811254 | -0.02 |
| -0.811245 | -0.02 |
| -0.811253 | -0.02 |
| -0.81125 | -0.02 |
| -0.811254 | -0.02 |
| -0.81124 | -0.02 |
| -0.811253 | -0.02 |
| -0.811251 | -0.02 |
| -0.811246 | -0.02 |
| -0.811241 | -0.02 |
| -0.81123 | -0.02 |
| -0.811236 | -0.02 |
| -0.811227 | -0.02 |
| -0.811235 | -0.02 |
| -0.811224 | -0.02 |
| -0.811227 | -0.02 |
| -0.81123 | -0.02 |
| -0.81123 | -0.02 |
| -0.811231 | -0.02 |
| -0.811237 | -0.02 |
| -0.811226 | -0.02 |
| -0.811229 | -0.02 |
| -0.811225 | -0.02 |
| -0.811223 | -0.02 |
| -0.81121 | -0.02 |
| -0.811219 | -0.02 |
| -0.811214 | -0.02 |
| -0.811206 | -0.02 |
| -0.811214 | -0.02 |
| -0.811211 | -0.02 |
| -0.811219 | -0.02 |
| -0.811221 | -0.02 |
| -0.811229 | -0.02 |
| -0.811228 | -0.02 |
| -0.811222 | -0.02 |
| -0.811218 | -0.02 |
| -0.811221 | -0.02 |
| -0.811213 | -0.02 |
| -0.811206 | -0.02 |
| -0.811211 | -0.02 |
| -0.811212 | -0.02 |
| -0.811214 | -0.02 |
| -0.811199 | -0.02 |
| -0.811199 | -0.02 |
| -0.811208 | -0.02 |
| -0.811199 | -0.02 |
| -0.811199 | -0.02 |
| -0.811198 | -0.02 |
| -0.811197 | -0.02 |
| -0.811198 | -0.02 |
| -0.811197 | -0.02 |
| -0.811195 | -0.02 |
| -0.811183 | -0.02 |
| -0.81118 | -0.02 |
| -0.811185 | -0.02 |
| -0.81118 | -0.02 |
| -0.81117 | -0.02 |
| -0.811176 | -0.02 |
| -0.811169 | -0.02 |
| -0.811175 | -0.02 |
| -0.811176 | -0.02 |
| -0.81117 | -0.02 |
| -0.811176 | -0.02 |
| -0.811177 | -0.02 |
| -0.81118 | -0.02 |
| -0.811168 | -0.02 |
| -0.811162 | -0.02 |
| -0.811163 | -0.02 |
| -0.811169 | -0.02 |
| -0.811152 | -0.02 |
| -0.811159 | -0.02 |
| -0.811158 | -0.02 |
| -0.811156 | -0.02 |
| -0.811153 | -0.02 |
| -0.811154 | -0.02 |
| -0.811149 | -0.02 |
| -0.81115 | -0.02 |
| -0.811147 | -0.02 |
| -0.811149 | -0.02 |
| -0.811153 | -0.02 |
| -0.811149 | -0.02 |
| -0.811146 | -0.02 |
| -0.811142 | -0.02 |
| -0.811141 | -0.02 |
| -0.811139 | -0.02 |
| -0.811149 | -0.02 |
| -0.811164 | -0.02 |
| -0.81114 | -0.02 |
| -0.811135 | -0.02 |
| -0.811137 | -0.02 |
| -0.811142 | -0.02 |
| -0.811132 | -0.02 |
| -0.811126 | -0.02 |
| -0.811125 | -0.02 |
| -0.811125 | -0.02 |
| -0.811118 | -0.02 |
| -0.811112 | -0.02 |
| -0.81113 | -0.02 |
| -0.811128 | -0.02 |
| -0.811115 | -0.02 |
| -0.81112 | -0.02 |
| -0.811104 | -0.02 |
| -0.811107 | -0.02 |
| -0.811106 | -0.02 |
| -0.811111 | -0.02 |
| -0.8111 | -0.02 |
| -0.811099 | -0.02 |
| -0.811094 | -0.02 |
| -0.811096 | -0.02 |
| -0.811093 | -0.02 |
| -0.81109 | -0.02 |
| -0.811086 | -0.02 |
| -0.811078 | -0.02 |
| -0.81108 | -0.02 |
| -0.811079 | -0.02 |
| -0.811084 | -0.02 |
| -0.811084 | -0.02 |
| -0.81109 | -0.02 |
| -0.811101 | -0.02 |
| -0.811112 | -0.02 |
| -0.811102 | -0.02 |
| -0.811106 | -0.02 |
| -0.811101 | -0.02 |
| -0.8111 | -0.02 |
| -0.8111 | -0.02 |
| -0.811106 | -0.02 |
| -0.811102 | -0.02 |
| -0.811099 | -0.02 |
| -0.811102 | -0.02 |
| -0.811103 | -0.02 |
| -0.811095 | -0.02 |
| -0.811105 | -0.02 |
| -0.811106 | -0.02 |
| -0.811112 | -0.02 |
| -0.811109 | -0.02 |
| -0.811114 | -0.02 |
| -0.81112 | -0.02 |
| -0.811115 | -0.02 |
| -0.811126 | -0.02 |
| -0.811123 | -0.02 |
| -0.811126 | -0.02 |
| -0.811127 | -0.02 |
| -0.811128 | -0.02 |
| -0.811122 | -0.02 |
| -0.811134 | -0.02 |
| -0.811129 | -0.02 |
| -0.811126 | -0.02 |
| -0.811124 | -0.02 |
| -0.811122 | -0.02 |
| -0.811119 | -0.02 |
| -0.811133 | -0.02 |
| -0.811112 | -0.02 |
| -0.811118 | -0.02 |
| -0.811104 | -0.02 |
| -0.811107 | -0.02 |
| -0.811106 | -0.02 |
| -0.811103 | -0.02 |
| -0.811105 | -0.02 |
| -0.811104 | -0.02 |
| -0.811095 | -0.02 |
| -0.811091 | -0.02 |
| -0.811103 | -0.02 |
| -0.811094 | -0.02 |
| -0.811099 | -0.02 |
| -0.811093 | -0.02 |
| -0.811094 | -0.02 |
| -0.8111 | -0.02 |
| -0.811096 | -0.02 |
| -0.811103 | -0.02 |
| -0.811089 | -0.02 |
| -0.811085 | -0.02 |
| -0.81109 | -0.02 |
| -0.8111 | -0.02 |
| -0.811088 | -0.02 |
| -0.811084 | -0.02 |
| -0.811084 | -0.02 |
| -0.811092 | -0.02 |
| -0.811084 | -0.02 |
| -0.81109 | -0.02 |
| -0.811084 | -0.02 |
| -0.811083 | -0.02 |
| -0.811091 | -0.02 |
| -0.811091 | -0.02 |
| -0.811086 | -0.02 |
| -0.811092 | -0.02 |
| -0.811094 | -0.02 |
| -0.811096 | -0.02 |
| -0.811101 | -0.02 |
| -0.811099 | -0.02 |
| -0.811103 | -0.02 |
| -0.811099 | -0.02 |
| -0.81109 | -0.02 |
| -0.811099 | -0.02 |
| -0.811094 | -0.02 |
| -0.811096 | -0.02 |
| -0.81108 | -0.02 |
| -0.811093 | -0.02 |
| -0.811086 | -0.02 |
| -0.81108 | -0.02 |
| -0.811082 | -0.02 |
| -0.811082 | -0.02 |
| -0.81108 | -0.02 |
| -0.811086 | -0.02 |
| -0.811079 | -0.02 |
| -0.811078 | -0.02 |
| -0.81108 | -0.02 |
| -0.811081 | -0.02 |
| -0.811075 | -0.02 |
| -0.811088 | -0.02 |
| -0.811071 | -0.02 |
| -0.811081 | -0.02 |
| -0.811071 | -0.02 |
| -0.811083 | -0.02 |
| -0.811069 | -0.02 |
| -0.811065 | -0.02 |
| -0.811068 | -0.02 |
| -0.811066 | -0.02 |
| -0.811061 | -0.02 |
| -0.811068 | -0.02 |
| -0.81106 | -0.02 |
| -0.811064 | -0.02 |
| -0.811073 | -0.02 |
| -0.811063 | -0.02 |
| -0.811061 | -0.02 |
| -0.811068 | -0.02 |
| -0.81106 | -0.02 |
| -0.811053 | -0.02 |
| -0.811051 | -0.02 |
| -0.811067 | -0.02 |
| -0.811066 | -0.02 |
| -0.811065 | -0.02 |
| -0.81106 | -0.02 |
| -0.811057 | -0.02 |
| -0.811063 | -0.02 |
| -0.81106 | -0.02 |
| -0.811065 | -0.02 |
| -0.811058 | -0.02 |
| -0.811052 | -0.02 |
| -0.811042 | -0.02 |
| -0.811047 | -0.02 |
| -0.811036 | -0.02 |
| -0.811033 | -0.02 |
| -0.811027 | -0.02 |
| -0.811032 | -0.02 |
| -0.811022 | -0.02 |
| -0.811014 | -0.02 |
| -0.811006 | -0.02 |
| -0.811021 | -0.02 |
| -0.81101 | -0.02 |
| -0.811007 | -0.02 |
| -0.810995 | -0.02 |
| -0.810997 | -0.02 |
| -0.810995 | -0.02 |
| -0.810993 | -0.02 |
| -0.810991 | -0.02 |
| -0.810992 | -0.02 |
| -0.810995 | -0.02 |
| -0.811 | -0.02 |
| -0.811005 | -0.02 |
| -0.811012 | -0.02 |
| -0.811021 | -0.02 |
| -0.811022 | -0.02 |
| -0.811024 | -0.02 |
| -0.811035 | -0.02 |
| -0.811041 | -0.02 |
| -0.811046 | -0.02 |
| -0.811051 | -0.02 |
| -0.811046 | -0.02 |
| -0.811049 | -0.02 |
| -0.811045 | -0.02 |
| -0.811057 | -0.02 |
| -0.811056 | -0.02 |
| -0.811041 | -0.02 |
| -0.81105 | -0.02 |
| -0.811056 | -0.02 |
| -0.811054 | -0.02 |
| -0.811061 | -0.02 |
| -0.811051 | -0.02 |
| -0.811051 | -0.02 |
| -0.811041 | -0.02 |
| -0.811039 | -0.02 |
| -0.81104 | -0.02 |
| -0.811025 | -0.02 |
| -0.811035 | -0.02 |
| -0.811056 | -0.02 |
| -0.811043 | -0.02 |
| -0.811043 | -0.02 |
| -0.811034 | -0.02 |
| -0.811041 | -0.02 |
| -0.811038 | -0.02 |
| -0.811035 | -0.02 |
| -0.811036 | -0.02 |
| -0.811037 | -0.02 |
| -0.81105 | -0.02 |
| -0.811037 | -0.02 |
| -0.811041 | -0.02 |
| -0.81103 | -0.02 |
| -0.811038 | -0.02 |
| -0.811029 | -0.02 |
| -0.811032 | -0.02 |
| -0.811031 | -0.02 |
| -0.811031 | -0.02 |
| -0.811028 | -0.02 |
| -0.811021 | -0.02 |
| -0.811013 | -0.02 |
| -0.811007 | -0.02 |
| -0.81101 | -0.02 |
| -0.811014 | -0.02 |
| -0.811008 | -0.02 |
| -0.811007 | -0.02 |
| -0.811005 | -0.02 |
| -0.811001 | -0.02 |
| -0.811006 | -0.02 |
| -0.810995 | -0.02 |
| -0.810994 | -0.02 |
| -0.810997 | -0.02 |
| -0.810994 | -0.02 |
| -0.810993 | -0.02 |
| -0.810981 | -0.02 |
| -0.810991 | -0.02 |
| -0.811002 | -0.02 |
| -0.810986 | -0.02 |
| -0.810995 | -0.02 |
| -0.811 | -0.02 |
| -0.811006 | -0.02 |
| -0.811002 | -0.02 |
| -0.81101 | -0.02 |
| -0.811014 | -0.02 |
| -0.811017 | -0.02 |
| -0.811026 | -0.02 |
| -0.81103 | -0.02 |
| -0.811041 | -0.02 |
| -0.811032 | -0.02 |
| -0.811042 | -0.02 |
| -0.811038 | -0.02 |
| -0.811035 | -0.02 |
| -0.811031 | -0.02 |
| -0.811033 | -0.02 |
| -0.811036 | -0.02 |
| -0.811036 | -0.02 |
| -0.81103 | -0.02 |
| -0.811024 | -0.02 |
| -0.811025 | -0.02 |
| -0.811027 | -0.02 |
| -0.811028 | -0.02 |
| -0.811019 | -0.02 |
| -0.811033 | -0.02 |
| -0.811024 | -0.02 |
| -0.811019 | -0.02 |
| -0.811018 | -0.02 |
| -0.811281 | -0.02 |
| -0.811281 | -0.02 |
| -0.811281 | -0.02 |
| -0.811281 | -0.02 |
| -0.81128 | -0.02 |
| -0.811283 | -0.02 |
| -0.811286 | -0.02 |
| -0.811287 | -0.02 |
| -0.811291 | -0.02 |
| -0.811294 | -0.02 |
| -0.811297 | -0.02 |
| -0.811299 | -0.02 |
| -0.811302 | -0.02 |
| -0.811304 | -0.02 |
| -0.811304 | -0.02 |
| -0.811306 | -0.02 |
| -0.811307 | -0.02 |
| -0.811307 | -0.02 |
| -0.811308 | -0.02 |
| -0.81131 | -0.02 |
| -0.811309 | -0.02 |
| -0.811311 | -0.02 |
| -0.811313 | -0.02 |
| -0.811314 | -0.02 |
| -0.811316 | -0.02 |
| -0.811316 | -0.02 |
| -0.811315 | -0.02 |
| -0.811318 | -0.02 |
| -0.811317 | -0.02 |
| -0.811318 | -0.02 |
| -0.811317 | -0.02 |
| -0.811316 | -0.02 |
| -0.811316 | -0.02 |
| -0.811314 | -0.02 |
| -0.811312 | -0.02 |
| -0.811311 | -0.02 |
| -0.811309 | -0.02 |
| -0.811307 | -0.02 |
| -0.811306 | -0.02 |
| -0.811304 | -0.02 |
| -0.811301 | -0.02 |
| -0.811298 | -0.02 |
| -0.811296 | -0.02 |
| -0.811292 | -0.02 |
| -0.811289 | -0.02 |
| -0.811287 | -0.02 |
| -0.81128 | -0.02 |
| -0.811277 | -0.02 |
| -0.811273 | -0.02 |
| -0.81127 | -0.02 |
| -0.811266 | -0.02 |
| -0.811264 | -0.02 |
| -0.811261 | -0.02 |
| -0.811255 | -0.02 |
| -0.811252 | -0.02 |
| -0.811245 | -0.02 |
| -0.811242 | -0.02 |
| -0.811235 | -0.02 |
| -0.81123 | -0.02 |
| -0.811225 | -0.02 |
| -0.811218 | -0.02 |
| -0.811213 | -0.02 |
| -0.811208 | -0.02 |
| -0.811202 | -0.02 |
| -0.811196 | -0.02 |
| -0.811191 | -0.02 |
| -0.811186 | -0.02 |
| -0.811183 | -0.02 |
| -0.811181 | -0.02 |
| -0.811178 | -0.02 |
| -0.811174 | -0.02 |
| -0.811169 | -0.02 |
| -0.811165 | -0.02 |
| -0.811162 | -0.02 |
| -0.811158 | -0.02 |
| -0.811155 | -0.02 |
| -0.811154 | -0.02 |
| -0.811154 | -0.02 |
| -0.811154 | -0.02 |
| -0.811154 | -0.02 |
| -0.811157 | -0.02 |
| -0.811162 | -0.02 |
| -0.811167 | -0.02 |
| -0.811172 | -0.02 |
| -0.811175 | -0.02 |
| -0.811178 | -0.02 |
| -0.811181 | -0.02 |
| -0.811183 | -0.02 |
| -0.811185 | -0.02 |
| -0.811186 | -0.02 |
| -0.811187 | -0.02 |
| -0.811185 | -0.02 |
| -0.811183 | -0.02 |
| -0.811181 | -0.02 |
| -0.811179 | -0.02 |
| -0.811176 | -0.02 |
| -0.811172 | -0.02 |
| -0.81117 | -0.02 |
| -0.811166 | -0.02 |
| -0.811162 | -0.02 |
| -0.811156 | -0.02 |
| -0.811153 | -0.02 |
| -0.811147 | -0.02 |
| -0.811144 | -0.02 |
| -0.811144 | -0.02 |
| -0.811147 | -0.02 |
| -0.811151 | -0.02 |
| -0.811152 | -0.02 |
| -0.811154 | -0.02 |
| -0.811159 | -0.02 |
| -0.811164 | -0.02 |
| -0.811167 | -0.02 |
| -0.811171 | -0.02 |
| -0.811173 | -0.02 |
| -0.81118 | -0.02 |
| -0.811186 | -0.02 |
| -0.81119 | -0.02 |
| -0.811196 | -0.02 |
| -0.811202 | -0.02 |
| -0.811206 | -0.02 |
| -0.811211 | -0.02 |
| -0.811214 | -0.02 |
| -0.811218 | -0.02 |
| -0.811222 | -0.02 |
| -0.811225 | -0.02 |
| -0.811229 | -0.02 |
| -0.81123 | -0.02 |
| -0.811232 | -0.02 |
| -0.811234 | -0.02 |
| -0.811236 | -0.02 |
| -0.811238 | -0.02 |
| -0.811241 | -0.02 |
| -0.811245 | -0.02 |
| -0.811246 | -0.02 |
| -0.81125 | -0.02 |
| -0.811251 | -0.02 |
| -0.811253 | -0.02 |
| -0.811253 | -0.02 |
| -0.811255 | -0.02 |
| -0.811253 | -0.02 |
| -0.811254 | -0.02 |
| -0.811252 | -0.02 |
| -0.811249 | -0.02 |
| -0.811247 | -0.02 |
| -0.811246 | -0.02 |
| -0.811243 | -0.02 |
| -0.81124 | -0.02 |
| -0.811237 | -0.02 |
| -0.811234 | -0.02 |
| -0.81123 | -0.02 |
| -0.811229 | -0.02 |
| -0.811226 | -0.02 |
| -0.811225 | -0.02 |
| -0.811225 | -0.02 |
| -0.811222 | -0.02 |
| -0.811221 | -0.02 |
| -0.811221 | -0.02 |
| -0.811218 | -0.02 |
| -0.811218 | -0.02 |
| -0.811218 | -0.02 |
| -0.811217 | -0.02 |
| -0.811215 | -0.02 |
| -0.811215 | -0.02 |
| -0.811214 | -0.02 |
| -0.811213 | -0.02 |
| -0.811211 | -0.02 |
| -0.81121 | -0.02 |
| -0.811206 | -0.02 |
| -0.811203 | -0.02 |
| -0.811199 | -0.02 |
| -0.811196 | -0.02 |
| -0.811193 | -0.02 |
| -0.81119 | -0.02 |
| -0.811188 | -0.02 |
| -0.811187 | -0.02 |
| -0.811187 | -0.02 |
| -0.811184 | -0.02 |
| -0.811181 | -0.02 |
| -0.81118 | -0.02 |
| -0.811179 | -0.02 |
| -0.81118 | -0.02 |
| -0.811178 | -0.02 |
| -0.811175 | -0.02 |
| -0.811172 | -0.02 |
| -0.81117 | -0.02 |
| -0.811168 | -0.02 |
| -0.811163 | -0.02 |
| -0.811161 | -0.02 |
| -0.811159 | -0.02 |
| -0.811155 | -0.02 |
| -0.811153 | -0.02 |
| -0.81115 | -0.02 |
| -0.811149 | -0.02 |
| -0.811147 | -0.02 |
| -0.811144 | -0.02 |
| -0.811144 | -0.02 |
| -0.811142 | -0.02 |
| -0.81114 | -0.02 |
| -0.811137 | -0.02 |
| -0.811135 | -0.02 |
| -0.811131 | -0.02 |
| -0.811127 | -0.02 |
| -0.811124 | -0.02 |
| -0.811121 | -0.02 |
| -0.811119 | -0.02 |
| -0.811114 | -0.02 |
| -0.811108 | -0.02 |
| -0.811106 | -0.02 |
| -0.811104 | -0.02 |
| -0.811103 | -0.02 |
| -0.8111 | -0.02 |
| -0.811099 | -0.02 |
| -0.811099 | -0.02 |
| -0.811096 | -0.02 |
| -0.811094 | -0.02 |
| -0.811091 | -0.02 |
| -0.811088 | -0.02 |
| -0.811084 | -0.02 |
| -0.81108 | -0.02 |
| -0.811078 | -0.02 |
| -0.811074 | -0.02 |
| -0.811068 | -0.02 |
| -0.811064 | -0.02 |
| -0.811061 | -0.02 |
| -0.811058 | -0.02 |
| -0.811054 | -0.02 |
| -0.81105 | -0.02 |
| -0.811047 | -0.02 |
| -0.811044 | -0.02 |
| -0.811042 | -0.02 |
| -0.81104 | -0.02 |
| -0.811038 | -0.02 |
| -0.811035 | -0.02 |
| -0.811033 | -0.02 |
| -0.811031 | -0.02 |
| -0.811028 | -0.02 |
| -0.811024 | -0.02 |
| -0.811022 | -0.02 |
| -0.811017 | -0.02 |
| -0.811015 | -0.02 |
| -0.811013 | -0.02 |
| -0.811009 | -0.02 |
| -0.811005 | -0.02 |
| -0.811004 | -0.02 |
| -0.811004 | -0.02 |
| -0.811006 | -0.02 |
| -0.811008 | -0.02 |
| -0.811009 | -0.02 |
| -0.81101 | -0.02 |
| -0.811012 | -0.02 |
| -0.811012 | -0.02 |
| -0.811013 | -0.02 |
| -0.811012 | -0.02 |
| -0.811012 | -0.02 |
| -0.811011 | -0.02 |
| -0.81101 | -0.02 |
| -0.811006 | -0.02 |
| -0.811003 | -0.02 |
| -0.810028 | -0.02 |
| -0.805029 | -0.017 |
| -0.800004 | -0.015 |
| -0.795012 | -0.013 |
| -0.790018 | -0.011 |
| -0.785053 | -0.01 |
| -0.780054 | -0.008 |
| -0.775026 | -0.007 |
| -0.770036 | -0.006 |
| -0.765041 | -0.005 |
| -0.760047 | -0.004 |
| -0.755051 | -0.004 |
| -0.750024 | -0.003 |
| -0.745031 | -0.003 |
| -0.740037 | -0.002 |
| -0.735047 | -0.002 |
| -0.73002 | -0.002 |
| -0.725023 | -0.001 |
| -0.720033 | -0.001 |
| -0.71506 | -0.001 |
| -0.710063 | -0.001 |
| -0.705032 | -0.001 |
| -0.700044 | -0.001 |
| -0.695045 | 0 |
| -0.690052 | 0 |
| -0.685026 | 0 |
| -0.680032 | 0 |
| -0.675038 | 0 |
| -0.67004 | 0 |
| -0.665044 | 0 |
| -0.660017 | 0 |
| -0.655042 | 0 |
| -0.650045 | 0 |
| -0.645047 | 0 |
| -0.640047 | 0 |
| -0.635022 | 0 |
| -0.630026 | 0 |
| -0.62503 | 0 |
| -0.620034 | 0 |
| -0.615006 | 0 |
| -0.61001 | 0 |
| -0.605015 | 0 |
| -0.600021 | 0 |
| -0.595027 | 0 |
| -0.590018 | 0 |
| -0.585018 | 0 |
| -0.580021 | 0 |
| -0.575025 | 0 |
| -0.570028 | 0 |
| -0.565004 | 0 |
| -0.560005 | 0 |
| -0.55501 | 0 |
| -0.550017 | 0 |
| -0.544987 | 0 |
| -0.539992 | 0 |
| -0.534996 | 0 |
| -0.530024 | 0 |
| -0.52503 | 0 |
| -0.520003 | 0 |
| -0.51501 | 0 |
| -0.510017 | 0 |
| -0.50502 | 0 |
| -0.499998 | 0 |
| -0.495007 | 0 |
| -0.490013 | 0 |
| -0.485021 | 0 |
| -0.480031 | 0 |
| -0.475004 | 0 |
| -0.470011 | 0 |
| -0.465023 | 0 |
| -0.460029 | 0 |
| -0.455039 | 0 |
| -0.450012 | 0 |
| -0.445021 | 0 |
| -0.44003 | 0 |
| -0.435036 | 0 |
| -0.430017 | 0 |
| -0.425025 | 0 |
| -0.42003 | 0 |
| -0.415041 | 0 |
| -0.41005 | 0 |
| -0.405023 | 0 |
| -0.40003 | 0 |
| -0.395035 | 0 |
| -0.390041 | 0 |
| -0.385046 | 0 |
| -0.38002 | 0 |
| -0.375027 | 0 |
| -0.370033 | 0 |
| -0.365041 | 0 |
| -0.360015 | 0 |
| -0.355022 | 0 |
| -0.350027 | 0 |
| -0.345035 | 0 |
| -0.34004 | 0 |
| -0.335011 | 0 |
| -0.33002 | 0 |
| -0.325025 | 0 |
| -0.320034 | 0 |
| -0.315005 | 0 |
| -0.310011 | 0 |
| -0.305018 | 0 |
| -0.300024 | 0 |
| -0.295033 | 0 |
| -0.290007 | 0 |
| -0.285013 | 0 |
| -0.280018 | 0 |
| -0.275027 | 0 |
| -0.27003 | 0 |
| -0.265002 | 0 |
| -0.260012 | 0 |
| -0.255016 | 0 |
| -0.250025 | 0 |
| -0.245003 | 0 |
| -0.240011 | 0 |
| -0.235018 | 0 |
| -0.230026 | 0 |
| -0.225038 | 0 |
| -0.220014 | 0 |
| -0.21502 | 0 |
| -0.209986 | 0 |
| -0.204989 | 0 |
| -0.199992 | 0 |
| -0.194993 | 0 |
| -0.189989 | 0 |
| -0.184991 | 0 |
| -0.179994 | 0 |
| -0.174998 | 0 |
| -0.169996 | 0 |
| -0.164996 | 0 |
| -0.159993 | 0 |
| -0.154999 | 0 |
| -0.150003 | 0 |
| -0.145007 | 0 |
| -0.140008 | 0 |
| -0.135006 | 0 |
| -0.130007 | 0 |
| -0.125006 | 0 |
| -0.12001 | 0 |
| -0.115005 | 0 |
| -0.110004 | 0 |
| -0.105 | 0 |
| -0.100002 | 0 |
| -0.095002 | 0 |
| -0.090002 | 0 |
| -0.084996 | 0 |
| -0.079996 | 0 |
| -0.074993 | 0 |
| -0.069994 | 0 |
| -0.064994 | 0 |
| -0.059994 | 0 |
| -0.054994 | 0 |
| -0.049992 | 0 |
| -0.044995 | 0 |
| -0.039995 | 0 |
| -0.034996 | 0 |
| -0.029994 | 0 |
| -0.024995 | 0 |
| -0.019995 | 0 |
| -0.014998 | 0 |
| -0.009996 | 0 |
| -0.004996 | 0 |
| 7e-06 | 0 |
| 0.005006 | 0 |
| 0.01001 | 0 |
| 0.015008 | 0 |
| 0.020008 | 0 |
| 0.025005 | 0 |
| 0.030007 | 0 |
| 0.035006 | 0 |
| 0.040008 | 0 |
| 0.045004 | 0 |
| 0.050004 | 0 |
| 0.055002 | 0 |
| 0.060006 | 0 |
| 0.065006 | 0 |
| 0.070006 | 0 |
| 0.075005 | 0 |
| 0.080007 | 0 |
| 0.085008 | 0 |
| 0.090014 | 0 |
| 0.095012 | 0 |
| 0.100014 | 0 |
| 0.105011 | 0 |
| 0.110014 | 0 |
| 0.115017 | 0 |
| 0.12002 | 0 |
| 0.125017 | 0 |
| 0.130017 | 0 |
| 0.135015 | 0 |
| 0.140018 | 0 |
| 0.145016 | 0 |
| 0.150014 | 0 |
| 0.155009 | 0 |
| 0.160007 | 0 |
| 0.165005 | 0 |
| 0.17001 | 0 |
| 0.17501 | 0 |
| 0.180006 | 0 |
| 0.185004 | 0 |
| 0.190002 | 0 |
| 0.195004 | 0 |
| 0.200003 | 0 |
| 0.205002 | 0 |
| 0.209997 | 0 |
| 0.21502 | 0 |
| 0.220013 | 0 |
| 0.225038 | 0 |
| 0.230026 | 0 |
| 0.235019 | 0 |
| 0.240009 | 0 |
| 0.245003 | 0 |
| 0.250025 | 0 |
| 0.255016 | 0 |
| 0.26001 | 0 |
| 0.265 | 0 |
| 0.270029 | 0 |
| 0.275023 | 0 |
| 0.280015 | 0 |
| 0.285011 | 0 |
| 0.290003 | 0 |
| 0.29503 | 0 |
| 0.30002 | 0 |
| 0.305013 | 0 |
| 0.310005 | 0 |
| 0.315032 | 0 |
| 0.320026 | 0 |
| 0.32502 | 0 |
| 0.330014 | 0 |
| 0.335004 | 0 |
| 0.340033 | 0 |
| 0.345027 | 0 |
| 0.350019 | 0 |
| 0.355014 | 0 |
| 0.36004 | 0 |
| 0.365032 | 0 |
| 0.370024 | 0 |
| 0.375018 | 0 |
| 0.380011 | 0 |
| 0.385037 | 0 |
| 0.39003 | 0 |
| 0.395026 | 0 |
| 0.400018 | 0 |
| 0.405011 | 0 |
| 0.410037 | 0 |
| 0.415027 | 0 |
| 0.420017 | 0 |
| 0.425011 | 0 |
| 0.430036 | 0 |
| 0.435022 | 0 |
| 0.440015 | 0 |
| 0.445005 | 0 |
| 0.449997 | 0 |
| 0.455022 | 0 |
| 0.460012 | 0 |
| 0.465005 | 0 |
| 0.469992 | 0 |
| 0.475017 | 0 |
| 0.480011 | 0 |
| 0.484999 | 0 |
| 0.489989 | 0 |
| 0.494983 | 0 |
| 0.500006 | 0 |
| 0.504996 | 0 |
| 0.509987 | 0 |
| 0.514977 | 0 |
| 0.520001 | 0 |
| 0.524991 | 0 |
| 0.529981 | 0 |
| 0.534974 | 0 |
| 0.539969 | 0 |
| 0.544996 | 0 |
| 0.549992 | 0 |
| 0.554983 | 0 |
| 0.559979 | 0 |
| 0.565007 | 0 |
| 0.569996 | 0 |
| 0.574992 | 0 |
| 0.579986 | 0 |
| 0.584979 | 0 |
| 0.590008 | 0 |
| 0.595 | 0 |
| 0.599995 | 0 |
| 0.604986 | 0 |
| 0.610014 | 0 |
| 0.615011 | 0 |
| 0.620003 | 0 |
| 0.624997 | 0 |
| 0.629991 | 0 |
| 0.635019 | 0 |
| 0.640008 | 0 |
| 0.645006 | 0 |
| 0.649999 | 0 |
| 0.655025 | 0 |
| 0.660019 | 0 |
| 0.665013 | 0 |
| 0.670007 | 0 |
| 0.675005 | 0 |
| 0.68003 | 0 |
| 0.685025 | 0 |
| 0.690014 | 0 |
| 0.695006 | 0 |
| 0.7 | 0 |
| 0.705021 | 0 |
| 0.710015 | 0 |
| 0.715007 | 0 |
| 0.72 | 0 |
| 0.725023 | 0 |
| 0.730018 | 0 |
| 0.735009 | 0 |
| 0.739999 | 0 |
| 0.744992 | 0 |
| 0.750018 | 0 |
| 0.75501 | 0 |
| 0.760003 | 0 |
| 0.764996 | 0 |
| 0.770021 | 0 |
| 0.775009 | 0 |
| 0.780001 | 0 |
| 0.784996 | 0 |
| 0.789987 | 0 |
| 0.795012 | 0 |
| 0.800003 | 0 |
| 0.804994 | 0 |
| 0.809994 | 0 |
| 0.815021 | 0 |
| 0.820017 | 0 |
| 0.825011 | 0 |
| 0.830009 | 0 |
| 0.835004 | 0 |
| 0.84003 | 0 |
| 0.845025 | 0 |
| 0.850025 | 0 |
| 0.855019 | 0 |
| 0.860043 | 0 |
| 0.865043 | 0 |
| 0.87004 | 0 |
| 0.875031 | 0 |
| 0.880029 | 0 |
| 0.885058 | 0 |
| 0.890054 | 0 |
| 0.89505 | 0 |
| 0.900046 | 0 |
| 0.905075 | 0 |
| 0.910067 | 0 |
| 0.915064 | 0 |
| 0.920061 | 0 |
| 0.925055 | 0 |
| 0.930084 | 0 |
| 0.935081 | 0 |
| 0.940076 | 0 |
| 0.94507 | 0 |
| 0.950099 | 0 |
| 0.955091 | 0 |
| 0.960082 | 0 |
| 0.965075 | 0 |
| 0.970066 | 0 |
| 0.975088 | 0 |
| 0.980082 | 0 |
| 0.985074 | 0 |
| 0.990067 | 0 |
| 0.99509 | 0 |
| 1.000082 | 0 |
| 1.005078 | 0 |
| 1.010065 | 0 |
| 1.015059 | 0 |
| 1.020085 | 0 |
| 1.025076 | 0 |
| 1.030071 | 0 |
| 1.03506 | 0 |
| 1.040053 | 0 |
| 1.045074 | 0 |
| 1.050066 | 0 |
| 1.055056 | 0 |
| 1.060049 | 0 |
| 1.065076 | 0 |
| 1.070068 | 0 |
| 1.07506 | 0 |
| 1.080054 | 0 |
| 1.085052 | 0 |
| 1.090082 | 0 |
| 1.095074 | 0 |
| 1.10007 | 0 |
| 1.105067 | 0 |
| 1.110095 | 0 |
| 1.115088 | 0 |
| 1.120083 | 0 |
| 1.125079 | 0 |
| 1.130074 | 0 |
| 1.135101 | 0 |
| 1.140101 | 0 |
| 1.145094 | 0 |
| 1.15009 | 0 |
| 1.155119 | 0 |
| 1.160114 | 0 |
| 1.165106 | 0 |
| 1.170106 | 0 |
| 1.175102 | 0 |
| 1.180125 | 0 |
| 1.185122 | 0 |
| 1.190117 | 0 |
| 1.195114 | 0 |
| 1.200142 | 0 |
| 1.205138 | 0 |
| 1.210134 | 0 |
| 1.215129 | 0 |
| 1.220121 | 0 |
| 1.22515 | 0 |
| 1.230139 | 0 |
| 1.235131 | 0 |
| 1.240124 | 0 |
| 1.245148 | 0 |
| 1.250138 | 0 |
| 1.255129 | 0 |
| 1.260123 | 0 |
| 1.265113 | 0 |
| 1.270138 | 0 |
| 1.27513 | 0 |
| 1.28012 | 0 |
| 1.285113 | 0 |
| 1.290137 | 0 |
| 1.295131 | 0 |
| 1.30012 | 0 |
| 1.305114 | 0 |
| 1.310109 | 0 |
| 1.315124 | 0 |
| 1.320119 | 0 |
| 1.325109 | 0 |
| 1.3301 | 0 |
| 1.335092 | 0 |
| 1.340118 | 0 |
| 1.345109 | 0 |
| 1.350103 | 0 |
| 1.355095 | 0 |
| 1.360126 | 0 |
| 1.365116 | 0 |
| 1.370111 | 0 |
| 1.375106 | 0 |
| 1.380098 | 0 |
| 1.385122 | 0 |
| 1.390118 | 0 |
| 1.395111 | 0 |
| 1.400103 | 0 |
| 1.405131 | 0 |
| 1.410125 | 0 |
| 1.415118 | 0 |
| 1.420113 | 0 |
| 1.425107 | 0 |
| 1.430135 | 0 |
| 1.435125 | 0 |
| 1.440118 | 0 |
| 1.445115 | 0 |
| 1.450137 | 0 |
| 1.455131 | 0 |
| 1.460127 | 0 |
| 1.465119 | 0 |
| 1.470115 | 0 |
| 1.475141 | 0 |
| 1.480135 | 0 |
| 1.485129 | 0 |
| 1.490116 | 0 |
| 1.495137 | 0 |
| 1.500128 | 0 |
| 1.505114 | 0 |
| 1.510104 | 0 |
| 1.515094 | 0 |
| 1.52011 | 0 |
| 1.525101 | 0 |
| 1.53009 | 0 |
| 1.535076 | 0 |
| 1.540097 | 0 |
| 1.545088 | 0 |
| 1.550072 | 0 |
| 1.555062 | 0 |
| 1.56005 | 0 |
| 1.565072 | 0 |
| 1.570059 | 0 |
| 1.575045 | 0 |
| 1.580037 | 0 |
| 1.585054 | 0 |
| 1.590042 | 0 |
| 1.595031 | 0 |
| 1.600019 | 0 |
| 1.605005 | 0 |
| 1.610029 | 0 |
| 1.615016 | 0 |
| 1.620007 | 0 |
| 1.625002 | 0 |
| 1.629996 | 0 |
| 1.635024 | 0 |
| 1.640017 | 0 |
| 1.645012 | 0 |
| 1.650007 | 0 |
| 1.65503 | 0 |
| 1.660024 | 0 |
| 1.665021 | 0 |
| 1.670012 | 0 |
| 1.675006 | 0 |
| 1.680035 | 0 |
| 1.68503 | 0 |
| 1.690023 | 0 |
| 1.695018 | 0 |
| 1.700045 | 0 |
| 1.705039 | 0 |
| 1.710034 | 0 |
| 1.715027 | 0 |
| 1.720021 | 0 |
| 1.725047 | 0 |
| 1.730042 | 0 |
| 1.735038 | 0 |
| 1.74003 | 0 |
| 1.74506 | 0 |
| 1.750055 | 0 |
| 1.755048 | 0 |
| 1.760042 | 0 |
| 1.765031 | 0 |
| 1.770053 | 0 |
| 1.775045 | 0 |
| 1.780033 | 0 |
| 1.785024 | 0 |
| 1.790045 | 0 |
| 1.795033 | 0 |
| 1.800022 | 0 |
| 1.805016 | 0 |
| 1.810005 | 0 |
| 1.815029 | 0 |
| 1.820019 | 0 |
| 1.825005 | 0 |
| 1.829997 | 0 |
| 1.835021 | 0 |
| 1.840007 | 0 |
| 1.844999 | 0 |
| 1.84999 | 0 |
| 1.854979 | 0 |
| 1.859999 | 0 |
| 1.864991 | 0 |
| 1.869979 | 0 |
| 1.874968 | 0 |
| 1.879989 | 0 |
| 1.884981 | 0 |
| 1.889971 | 0 |
| 1.894965 | 0 |
| 1.899962 | 0 |
| 1.904987 | 0 |
| 1.909978 | 0 |
| 1.914976 | 0 |
| 1.919969 | 0 |
| 1.924959 | 0 |
| 1.929986 | 0 |
| 1.934979 | 0 |
| 1.939973 | 0 |
| 1.944966 | 0 |
| 1.949992 | 0 |
| 1.954988 | 0 |
| 1.959978 | 0 |
| 1.964973 | 0 |
| 1.969969 | 0 |
| 1.974993 | 0 |
| 1.97999 | 0 |
| 1.984982 | 0 |
| 1.989976 | 0 |
| 1.995001 | 0 |
| 1.999992 | 0 |
| 2.004987 | 0 |
| 2.00998 | 0 |
| 2.014975 | 0 |
| 2.020002 | 0 |
| 2.024997 | 0 |
| 2.029991 | 0 |
| 2.03498 | 0 |
| 2.040002 | 0 |
| 2.044991 | 0 |
| 2.049983 | 0 |
| 2.054973 | 0 |
| 2.059956 | 0 |
| 2.064981 | 0 |
| 2.069972 | 0 |
| 2.074962 | 0 |
| 2.079952 | 0 |
| 2.084974 | 0 |
| 2.089966 | 0 |
| 2.09495 | 0 |
| 2.099942 | 0 |
| 2.105364 | 0 |
| 2.110337 | 0 |
| 2.115279 | 0 |
| 2.120238 | 0 |
| 2.125192 | 0 |
| 2.13015 | 0 |
| 2.135107 | 0 |
| 2.140391 | 0 |
| 2.145347 | 0 |
| 2.150306 | 0 |
| 2.155274 | 0 |
| 2.16022 | 0 |
| 2.165177 | 0 |
| 2.170129 | 0 |
| 2.175126 | 0 |
| 2.180408 | 0 |
| 2.185363 | 0 |
| 2.19032 | 0 |
| 2.195281 | 0 |
| 2.200238 | 0 |
| 2.205189 | 0 |
| 2.21014 | 0 |
| 2.215126 | 0 |
| 2.220423 | 0 |
| 2.225374 | 0 |
| 2.230335 | 0 |
| 2.2353 | 0 |
| 2.240248 | 0 |
| 2.245204 | 0 |
| 2.250149 | 0 |
| 2.255108 | 0 |
| 2.260434 | 0 |
| 2.265393 | 0 |
| 2.270342 | 0 |
| 2.275294 | 0 |
| 2.280269 | 0 |
| 2.28521 | 0 |
| 2.290156 | 0 |
| 2.295112 | 0 |
| 2.300048 | 0 |
| 2.305335 | 0 |
| 2.310291 | 0 |
| 2.315246 | 0 |
| 2.320216 | 0 |
| 2.325174 | 0 |
| 2.33013 | 0 |
| 2.33508 | 0 |
| 2.340038 | 0 |
| 2.345346 | 0 |
| 2.350306 | 0 |
| 2.355264 | 0 |
| 2.360224 | 0 |
| 2.365188 | 0 |
| 2.370136 | 0 |
| 2.375096 | 0 |
| 2.38004 | 0 |
| 2.385362 | 0 |
| 2.390318 | 0 |
| 2.395277 | 0 |
| 2.400233 | 0 |
| 2.405204 | 0 |
| 2.410156 | 0 |
| 2.41511 | 0 |
| 2.420061 | 0 |
| 2.425366 | 0 |
| 2.430332 | 0 |
| 2.435282 | 0 |
| 2.44024 | 0 |
| 2.445196 | 0 |
| 2.450157 | 0 |
| 2.455116 | 0 |
| 2.460066 | 0 |
| 2.465028 | 0 |
| 2.470317 | 0 |
| 2.475271 | 0 |
| 2.480233 | 0 |
| 2.485184 | 0 |
| 2.49016 | 0 |
| 2.495111 | 0 |
| 2.500066 | 0 |
| 2.505027 | 0 |
| 2.510336 | 0 |
| 2.515292 | 0 |
| 2.520253 | 0 |
| 2.525204 | 0 |
| 2.530172 | 0 |
| 2.535136 | 0 |
| 2.540084 | 0 |
| 2.545045 | 0 |
| 2.550324 | 0 |
| 2.555309 | 0 |
| 2.560266 | 0 |
| 2.565214 | 0 |
| 2.570178 | 0 |
| 2.575151 | 0 |
| 2.580104 | 0 |
| 2.585051 | 0 |
| 2.590341 | 0 |
| 2.595319 | 0 |
| 2.6003 | 0 |
| 2.605247 | 0 |
| 2.610193 | 0 |
| 2.615154 | 0 |
| 2.62011 | 0 |
| 2.625065 | 0 |
| 2.630024 | 0 |
| 2.6353 | 0 |
| 2.640276 | 0 |
| 2.645246 | 0 |
| 2.650202 | 0 |
| 2.655163 | 0 |
| 2.660132 | 0 |
| 2.665093 | 0 |
| 2.670061 | 0 |
| 2.675344 | 0 |
| 2.680339 | 0 |
| 2.685294 | 0 |
| 2.690255 | 0 |
| 2.695217 | 0 |
| 2.700171 | 0 |
| 2.705138 | 0 |
| 2.710094 | 0 |
| 2.715388 | 0 |
| 2.720342 | 0 |
| 2.725333 | 0 |
| 2.730293 | 0 |
| 2.735245 | 0 |
| 2.740214 | 0 |
| 2.74519 | 0 |
| 2.750138 | 0 |
| 2.755097 | 0 |
| 2.760379 | 0 |
| 2.765373 | 0 |
| 2.770333 | 0 |
| 2.775292 | 0 |
| 2.780251 | 0 |
| 2.785226 | 0 |
| 2.790178 | 0 |
| 2.795136 | 0 |
| 2.800425 | 0 |
| 2.805374 | 0 |
| 2.810342 | 0 |
| 2.815307 | 0 |
| 2.820272 | 0 |
| 2.825229 | 0 |
| 2.830206 | 0 |
| 2.835159 | 0 |
| 2.840455 | 0 |
| 2.845411 | 0 |
| 2.85041 | 0 |
| 2.855362 | 0 |
| 2.860322 | 0 |
| 2.865283 | 0 |
| 2.870254 | 0 |
| 2.875214 | 0 |
| 2.880502 | 0 |
| 2.885296 | 0 |
| 2.890258 | 0 |
| 2.895247 | 0 |
| 2.900197 | 0 |
| 2.905158 | 0 |
| 2.910113 | 0 |
| 2.915077 | 0 |
| 2.920045 | 0 |
| 2.925327 | 0 |
| 2.930286 | 0 |
| 2.935269 | 0 |
| 2.940229 | 0 |
| 2.945177 | 0 |
| 2.950144 | 0 |
| 2.955114 | 0 |
| 2.960064 | 0 |
| 2.965343 | 0 |
| 2.970303 | 0 |
| 2.975263 | 0 |
| 2.980198 | 0 |
| 2.985162 | 0 |
| 2.990108 | 0 |
| 2.995065 | 0 |
| 3.000041 | 0 |
| 3.005336 | 0 |
| 3.010278 | 0 |
| 3.01524 | 0 |
| 3.020231 | 0 |
| 3.025196 | 0 |
| 3.030153 | 0 |
| 3.035111 | 0 |
| 3.040078 | 0 |
| 3.045356 | 0 |
| 3.050316 | 0 |
| 3.055269 | 0 |
| 3.060258 | 0 |
| 3.065223 | 0 |
| 3.070177 | 0 |
| 3.075127 | 0 |
| 3.080089 | 0 |
| 3.085059 | 0 |
| 3.090345 | 0 |
| 3.095294 | 0 |
| 3.100255 | 0 |
| 3.105245 | 0 |
| 3.110206 | 0 |
| 3.115166 | 0 |
| 3.120119 | 0 |
| 3.125087 | 0 |
| 3.130373 | 0 |
| 3.135325 | 0 |
| 3.14027 | 0 |
| 3.145243 | 0 |
| 3.150208 | 0 |
| 3.155159 | 0 |
| 3.160117 | 0 |
| 3.16508 | 0 |
| 3.170382 | 0 |
| 3.175339 | 0 |
| 3.18029 | 0 |
| 3.185244 | 0 |
| 3.190247 | 0 |
| 3.195208 | 0 |
| 3.200162 | 0 |
| 3.205104 | 0 |
| 3.210414 | 0 |
| 3.215374 | 0 |
| 3.220328 | 0 |
| 3.225287 | 0 |
| 3.230274 | 0 |
| 3.235233 | 0 |
| 3.240186 | 0 |
| 3.245142 | 0 |
| 3.2501 | 0 |
| 3.255394 | 0 |
| 3.260358 | 0 |
| 3.265316 | 0 |
| 3.270273 | 0 |
| 3.275263 | 0 |
| 3.280213 | 0 |
| 3.285175 | 0 |
| 3.29013 | 0 |
| 3.295435 | 0 |
| 3.300389 | 0 |
| 3.305344 | 0 |
| 3.310304 | 0 |
| 3.315263 | 0 |
| 3.320214 | 0 |
| 3.325173 | 0 |
| 3.330137 | 0 |
| 3.335428 | 0 |
| 3.340398 | 0 |
| 3.34535 | 0 |
| 3.350305 | 0 |
| 3.355266 | 0 |
| 3.360259 | 0 |
| 3.365214 | 0 |
| 3.370176 | 0 |
| 3.375136 | 0 |
| 3.380424 | 0 |
| 3.385387 | 0 |
| 3.390342 | 0 |
| 3.395304 | 0 |
| 3.400288 | 0 |
| 3.405249 | 0 |
| 3.410205 | 0 |
| 3.415159 | 0 |
| 3.420474 | 0 |
| 3.425421 | 0 |
| 3.430386 | 0 |
| 3.435342 | 0 |
| 3.440299 | 0 |
| 3.445295 | 0 |
| 3.450251 | 0 |
| 3.455209 | 0 |
| 3.460485 | 0 |
| 3.465461 | 0 |
| 3.470417 | 0 |
| 3.475384 | 0 |
| 3.480318 | 0 |
| 3.485303 | 0 |
| 3.490274 | 0 |
| 3.495225 | 0 |
| 3.50051 | 0 |
| 3.50549 | 0 |
| 3.510451 | 0 |
| 3.515404 | 0 |
| 3.520363 | 0 |
| 3.525318 | 0 |
| 3.530318 | 0 |
| 3.535278 | 0 |
| 3.540223 | 0 |
| 3.545518 | 0 |
| 3.550485 | 0 |
| 3.555441 | 0 |
| 3.560404 | 0 |
| 3.565361 | 0 |
| 3.570347 | 0 |
| 3.575315 | 0 |
| 3.580274 | 0 |
| 3.585563 | 0 |
| 3.590369 | 0 |
| 3.595326 | 0 |
| 3.600281 | 0 |
| 3.605239 | 0 |
| 3.610193 | 0 |
| 3.615185 | 0 |
| 3.62014 | 0 |
| 3.625424 | 0 |
| 3.630385 | 0 |
| 3.63535 | 0 |
| 3.640308 | 0 |
| 3.645256 | 0 |
| 3.650225 | 0 |
| 3.65516 | 0 |
| 3.660112 | 0 |
| 3.665397 | 0 |
| 3.670358 | 0 |
| 3.675328 | 0 |
| 3.68028 | 0 |
| 3.685244 | 0 |
| 3.690202 | 0 |
| 3.695183 | 0 |
| 3.700137 | 0 |
| 3.705095 | 0 |
| 3.710385 | 0 |
| 3.715333 | 0 |
| 3.72031 | 0 |
| 3.72527 | 0 |
| 3.730224 | 0 |
| 3.735178 | 0 |
| 3.740169 | 0 |
| 3.745117 | 0 |
| 3.750411 | 0 |
| 3.755356 | 0 |
| 3.760337 | 0 |
| 3.76529 | 0 |
| 3.77024 | 0 |
| 3.775204 | 0 |
| 3.780193 | 0 |
| 3.785149 | 0 |
| 3.790445 | 0 |
| 3.795389 | 0 |
| 3.800344 | 0 |
| 3.805315 | 0 |
| 3.810278 | 0 |
| 3.815227 | 0 |
| 3.820182 | 0 |
| 3.825145 | 0 |
| 3.830106 | 0 |
| 3.835392 | 0 |
| 3.840353 | 0 |
| 3.845321 | 0 |
| 3.850281 | 0 |
| 3.855243 | 0 |
| 3.860196 | 0 |
| 3.865177 | 0 |
| 3.870133 | 0 |
| 3.875425 | 0 |
| 3.880389 | 0 |
| 3.885343 | 0 |
| 3.89031 | 0 |
| 3.895267 | 0 |
| 3.900217 | 0 |
| 3.905171 | 0 |
| 3.910167 | 0 |
| 3.915451 | 0 |
| 3.920403 | 0 |
| 3.925365 | 0 |
| 3.930336 | 0 |
| 3.935291 | 0 |
| 3.940247 | 0 |
| 3.945207 | 0 |
| 3.950203 | 0 |
| 3.955489 | 0 |
| 3.960448 | 0 |
| 3.965399 | 0 |
| 3.970381 | 0 |
| 3.975336 | 0 |
| 3.980277 | 0 |
| 3.985234 | 0 |
| 3.990205 | 0 |
| 3.995178 | 0 |
| 4.00047 | 0 |
| 4.005426 | 0 |
| 4.010387 | 0 |
| 4.015361 | 0 |
| 4.020315 | 0 |
| 4.025264 | 0 |
| 4.030224 | 0 |
| 4.035206 | 0 |
| 4.040507 | 0 |
| 4.045454 | 0 |
| 4.050415 | 0 |
| 4.055379 | 0 |
| 4.060334 | 0 |
| 4.065289 | 0 |
| 4.070241 | 0 |
| 4.075197 | 0 |
| 4.080523 | 0 |
| 4.085464 | 0 |
| 4.090425 | 0 |
| 4.095386 | 0 |
| 4.100355 | 0 |
| 4.105309 | 0 |
| 4.110263 | 0 |
| 4.115213 | 0 |
| 4.120527 | 0 |
| 4.125485 | 0 |
| 4.130436 | 0 |
| 4.135402 | 0 |
| 4.140368 | 0 |
| 4.145326 | 0 |
| 4.15026 | 0 |
| 4.155235 | 0 |
| 4.160181 | 0 |
| 4.165483 | 0 |
| 4.170445 | 0 |
| 4.175395 | 0 |
| 4.180351 | 0 |
| 4.18532 | 0 |
| 4.190282 | 0 |
| 4.19523 | 0 |
| 4.200193 | 0 |
| 4.205503 | 0 |
| 4.210474 | 0 |
| 4.215418 | 0 |
| 4.220377 | 0 |
| 4.225344 | 0 |
| 4.230299 | 0 |
| 4.23525 | 0 |
| 4.240206 | 0 |
| 4.2455 | 0 |
| 4.250475 | 0 |
| 4.255427 | 0 |
| 4.260394 | 0 |
| 4.265335 | 0 |
| 4.270319 | 0 |
| 4.275275 | 0 |
| 4.280228 | 0 |
| 4.285509 | 0 |
| 4.29049 | 0 |
| 4.29546 | 0 |
| 4.300409 | 0 |
| 4.305374 | 0 |
| 4.310336 | 0 |
| 4.315289 | 0 |
| 4.320241 | 0 |
| 4.325196 | 0 |
| 4.330457 | 0 |
| 4.335416 | 0 |
| 4.340383 | 0 |
| 4.345348 | 0 |
| 4.350296 | 0 |
| 4.355269 | 0 |
| 4.360229 | 0 |
| 4.365181 | 0 |
| 4.370457 | 0 |
| 4.375466 | 0 |
| 4.380415 | 0 |
| 4.385377 | 0 |
| 4.390326 | 0 |
| 4.395301 | 0 |
| 4.400249 | 0 |
| 4.405208 | 0 |
| 4.410322 | 0 |
| 4.415299 | 0 |
| 4.420269 | 0 |
| 4.42521 | 0 |
| 4.430173 | 0 |
| 4.435121 | 0 |
| 4.440095 | 0 |
| 4.445049 | 0 |
| 4.450002 | 0 |
| 4.455283 | 0 |
| 4.460275 | 0 |
| 4.465234 | 0 |
| 4.470186 | 0 |
| 4.475139 | 0 |
| 4.480106 | 0 |
| 4.485061 | 0 |
| 4.489999 | 0 |
| 4.495297 | 0 |
| 4.500242 | 0 |
| 4.505203 | 0 |
| 4.510157 | 0 |
| 4.515119 | 0 |
| 4.520073 | 0 |
| 4.525047 | 0 |
| 4.530001 | 0 |
| 4.535289 | 0 |
| 4.54024 | 0 |
| 4.545236 | 0 |
| 4.550183 | 0 |
| 4.555129 | 0 |
| 4.560093 | 0 |
| 4.56506 | 0 |
| 4.570009 | 0 |
| 4.575289 | 0 |
| 4.580247 | 0 |
| 4.585225 | 0 |
| 4.590188 | 0 |
| 4.595138 | 0 |
| 4.600097 | 0 |
| 4.605052 | 0 |
| 4.610013 | 0 |
| 4.614969 | 0 |
| 4.620248 | 0 |
| 4.625203 | 0 |
| 4.630194 | 0 |
| 4.635152 | 0 |
| 4.6401 | 0 |
| 4.645057 | 0 |
| 4.650016 | 0 |
| 4.654974 | 0 |
| 4.660251 | 0 |
| 4.665205 | 0 |
| 4.670169 | 0 |
| 4.675129 | 0 |
| 4.680068 | 0 |
| 4.685033 | 0 |
| 4.689997 | 0 |
| 4.694955 | 0 |
| 4.70024 | 0 |
| 4.705197 | 0 |
| 4.71015 | 0 |
| 4.715143 | 0 |
| 4.720102 | 0 |
| 4.725042 | 0 |
| 4.730017 | 0 |
| 4.734976 | 0 |
| 4.740268 | 0 |
| 4.745213 | 0 |
| 4.750157 | 0 |
| 4.755145 | 0 |
| 4.760111 | 0 |
| 4.765064 | 0 |
| 4.770025 | 0 |
| 4.774987 | 0 |
| 4.779951 | 0 |
| 4.78522 | 0 |
| 4.790187 | 0 |
| 4.795137 | 0 |
| 4.800126 | 0 |
| 4.805087 | 0 |
| 4.810037 | 0 |
| 4.814986 | 0 |
| 4.819957 | 0 |
| 4.825241 | 0 |
| 4.830182 | 0 |
| 4.835147 | 0 |
| 4.840101 | 0 |
| 4.845062 | 0 |
| 4.850025 | 0 |
| 4.854972 | 0 |
| 4.859951 | 0 |
| 4.865248 | 0 |
| 4.870192 | 0 |
| 4.875148 | 0 |
| 4.880125 | 0 |
| 4.88508 | 0 |
| 4.890049 | 0 |
| 4.894998 | 0 |
| 4.899948 | 0 |
| 4.905248 | 0 |
| 4.910211 | 0 |
| 4.915162 | 0 |
| 4.920111 | 0.001 |
| 4.925098 | 0.001 |
| 4.930058 | 0.001 |
| 4.935009 | 0.001 |
| 4.93997 | 0.001 |
| 4.944942 | 0.001 |
| 4.950228 | 0.001 |
| 4.955172 | 0.001 |
| 4.960134 | 0.001 |
| 4.965119 | 0.001 |
| 4.970081 | 0.001 |
| 4.975017 | 0.001 |
| 4.979988 | 0.001 |
| 4.984941 | 0.001 |
| 4.990245 | 0.001 |
| 4.995192 | 0.001 |
| 5.000145 | 0.001 |
| 5.005111 | 0.001 |
| 5.01004 | 0.001 |
| 5.015003 | 0.001 |
| 5.019964 | 0.001 |
| 5.024922 | 0.001 |
| 5.030223 | 0.001 |
| 5.03518 | 0.001 |
| 5.040134 | 0.001 |
| 5.045086 | 0.001 |
| 5.050083 | 0.001 |
| 5.05504 | 0.001 |
| 5.059993 | 0.001 |
| 5.06495 | 0.001 |
| 5.069914 | 0.001 |
| 5.07521 | 0.001 |
| 5.080168 | 0.001 |
| 5.085125 | 0.001 |
| 5.090082 | 0.001 |
| 5.095065 | 0.001 |
| 5.100037 | 0.001 |
| 5.104815 | 0.001 |
| 5.109775 | 0.001 |
| 5.115055 | 0.001 |
| 5.120021 | 0.001 |
| 5.124977 | 0.001 |
| 5.129921 | 0.001 |
| 5.134909 | 0.001 |
| 5.139874 | 0.001 |
| 5.144824 | 0.001 |
| 5.149782 | 0.001 |
| 5.155073 | 0.001 |
| 5.160026 | 0.001 |
| 5.164976 | 0.001 |
| 5.169919 | 0.001 |
| 5.174891 | 0.002 |
| 5.179848 | 0.002 |
| 5.184813 | 0.002 |
| 5.189762 | 0.002 |
| 5.195042 | 0.002 |
| 5.200013 | 0.002 |
| 5.204969 | 0.002 |
| 5.209922 | 0.002 |
| 5.214875 | 0.002 |
| 5.219859 | 0.002 |
| 5.224824 | 0.002 |
| 5.229774 | 0.002 |
| 5.234734 | 0.002 |
| 5.240032 | 0.002 |
| 5.244985 | 0.002 |
| 5.24993 | 0.002 |
| 5.254892 | 0.002 |
| 5.259846 | 0.003 |
| 5.264836 | 0.003 |
| 5.269789 | 0.003 |
| 5.274748 | 0.003 |
| 5.280034 | 0.003 |
| 5.285013 | 0.003 |
| 5.28995 | 0.003 |
| 5.294914 | 0.003 |
| 5.299873 | 0.003 |
| 5.304865 | 0.004 |
| 5.309816 | 0.004 |
| 5.314776 | 0.004 |
| 5.320059 | 0.004 |
| 5.325028 | 0.004 |
| 5.329996 | 0.005 |
| 5.334956 | 0.005 |
| 5.33991 | 0.005 |
| 5.344861 | 0.005 |
| 5.349843 | 0.006 |
| 5.354811 | 0.006 |
| 5.360106 | 0.006 |
| 5.365068 | 0.007 |
| 5.370047 | 0.007 |
| 5.375027 | 0.008 |
| 5.379987 | 0.008 |
| 5.384963 | 0.009 |
| 5.389966 | 0.01 |
| 5.394676 | 0.011 |
| 5.399633 | 0.012 |
| 5.404925 | 0.013 |
| 5.409889 | 0.014 |
| 5.414847 | 0.016 |
| 5.419804 | 0.017 |
| 5.424767 | 0.019 |
| 5.426342 | 0.02 |
| 5.426425 | 0.02 |
| 5.426491 | 0.02 |
| 5.42655 | 0.02 |
| 5.426607 | 0.02 |
| 5.426678 | 0.02 |
| 5.426733 | 0.02 |
| 5.426796 | 0.02 |
| 5.426839 | 0.02 |
| 5.426898 | 0.02 |
| 5.426965 | 0.02 |
| 5.427018 | 0.02 |
| 5.427076 | 0.02 |
| 5.427139 | 0.02 |
| 5.427195 | 0.02 |
| 5.427261 | 0.02 |
| 5.427315 | 0.02 |
| 5.427357 | 0.02 |
| 5.427423 | 0.02 |
| 5.427483 | 0.02 |
| 5.427542 | 0.02 |
| 5.427591 | 0.02 |
| 5.427654 | 0.02 |
| 5.427705 | 0.02 |
| 5.427767 | 0.02 |
| 5.427826 | 0.02 |
| 5.427875 | 0.02 |
| 5.427928 | 0.02 |
| 5.427987 | 0.02 |
| 5.428021 | 0.02 |
| 5.428094 | 0.02 |
| 5.428137 | 0.02 |
| 5.42819 | 0.02 |
| 5.428246 | 0.02 |
| 5.428294 | 0.02 |
| 5.42834 | 0.02 |
| 5.428398 | 0.02 |
| 5.428451 | 0.02 |
| 5.428514 | 0.02 |
| 5.428564 | 0.02 |
| 5.4286 | 0.02 |
| 5.428653 | 0.02 |
| 5.428709 | 0.02 |
| 5.428765 | 0.02 |
| 5.428813 | 0.02 |
| 5.428874 | 0.02 |
| 5.428912 | 0.02 |
| 5.428974 | 0.02 |
| 5.429039 | 0.02 |
| 5.429085 | 0.02 |
| 5.429137 | 0.02 |
| 5.429202 | 0.02 |
| 5.429243 | 0.02 |
| 5.4293 | 0.02 |
| 5.429361 | 0.02 |
| 5.429407 | 0.02 |
| 5.429467 | 0.02 |
| 5.429521 | 0.02 |
| 5.429586 | 0.02 |
| 5.42964 | 0.02 |
| 5.429685 | 0.02 |
| 5.429752 | 0.02 |
| 5.429799 | 0.02 |
| 5.429849 | 0.02 |
| 5.429901 | 0.02 |
| 5.429947 | 0.02 |
| 5.430005 | 0.02 |
| 5.430057 | 0.02 |
| 5.430108 | 0.02 |
| 5.430151 | 0.02 |
| 5.430202 | 0.02 |
| 5.43026 | 0.02 |
| 5.43031 | 0.02 |
| 5.430365 | 0.02 |
| 5.430421 | 0.02 |
| 5.430462 | 0.02 |
| 5.430508 | 0.02 |
| 5.430562 | 0.02 |
| 5.430617 | 0.02 |
| 5.43066 | 0.02 |
| 5.430716 | 0.02 |
| 5.43076 | 0.02 |
| 5.430809 | 0.02 |
| 5.430864 | 0.02 |
| 5.430908 | 0.02 |
| 5.430964 | 0.02 |
| 5.430999 | 0.02 |
| 5.43106 | 0.02 |
| 5.431091 | 0.02 |
| 5.431147 | 0.02 |
| 5.431191 | 0.02 |
| 5.43123 | 0.02 |
| 5.43128 | 0.02 |
| 5.431336 | 0.02 |
| 5.431378 | 0.02 |
| 5.431417 | 0.02 |
| 5.431484 | 0.02 |
| 5.43152 | 0.02 |
| 5.431568 | 0.02 |
| 5.431616 | 0.02 |
| 5.431653 | 0.02 |
| 5.431696 | 0.02 |
| 5.431736 | 0.02 |
| 5.431788 | 0.02 |
| 5.431822 | 0.02 |
| 5.43186 | 0.02 |
| 5.431913 | 0.02 |
| 5.431951 | 0.02 |
| 5.432 | 0.02 |
| 5.432038 | 0.02 |
| 5.432076 | 0.02 |
| 5.432102 | 0.02 |
| 5.432151 | 0.02 |
| 5.432198 | 0.02 |
| 5.432233 | 0.02 |
| 5.432268 | 0.02 |
| 5.432302 | 0.02 |
| 5.432347 | 0.02 |
| 5.4324 | 0.02 |
| 5.43244 | 0.02 |
| 5.432473 | 0.02 |
| 5.432527 | 0.02 |
| 5.432568 | 0.02 |
| 5.432618 | 0.02 |
| 5.432651 | 0.02 |
| 5.432686 | 0.02 |
| 5.432745 | 0.02 |
| 5.432771 | 0.02 |
| 5.432809 | 0.02 |
| 5.432857 | 0.02 |
| 5.432896 | 0.02 |
| 5.43294 | 0.02 |
| 5.432969 | 0.02 |
| 5.433007 | 0.02 |
| 5.433053 | 0.02 |
| 5.433078 | 0.02 |
| 5.433127 | 0.02 |
| 5.433175 | 0.02 |
| 5.433213 | 0.02 |
| 5.433261 | 0.02 |
| 5.433296 | 0.02 |
| 5.433349 | 0.02 |
| 5.433376 | 0.02 |
| 5.433434 | 0.02 |
| 5.433467 | 0.02 |
| 5.433518 | 0.02 |
| 5.433553 | 0.02 |
| 5.433594 | 0.02 |
| 5.433628 | 0.02 |
| 5.433665 | 0.02 |
| 5.433724 | 0.02 |
| 5.433765 | 0.02 |
| 5.433808 | 0.02 |
| 5.433831 | 0.02 |
| 5.433878 | 0.02 |
| 5.433908 | 0.02 |
| 5.433945 | 0.02 |
| 5.433992 | 0.02 |
| 5.434015 | 0.02 |
| 5.434065 | 0.02 |
| 5.434102 | 0.02 |
| 5.434143 | 0.02 |
| 5.434177 | 0.02 |
| 5.434216 | 0.02 |
| 5.434245 | 0.02 |
| 5.434284 | 0.02 |
| 5.434325 | 0.02 |
| 5.434357 | 0.02 |
| 5.434391 | 0.02 |
| 5.434424 | 0.02 |
| 5.434465 | 0.02 |
| 5.434511 | 0.02 |
| 5.434531 | 0.02 |
| 5.434574 | 0.02 |
| 5.434611 | 0.02 |
| 5.434662 | 0.02 |
| 5.434693 | 0.02 |
| 5.434741 | 0.02 |
| 5.43479 | 0.02 |
| 5.434817 | 0.02 |
| 5.434852 | 0.02 |
| 5.434901 | 0.02 |
| 5.43494 | 0.02 |
| 5.434976 | 0.02 |
| 5.435014 | 0.02 |
| 5.43506 | 0.02 |
| 5.435096 | 0.02 |
| 5.435144 | 0.02 |
| 5.435166 | 0.02 |
| 5.435214 | 0.02 |
| 5.435249 | 0.02 |
| 5.435291 | 0.02 |
| 5.435339 | 0.02 |
| 5.435378 | 0.02 |
| 5.43541 | 0.02 |
| 5.435458 | 0.02 |
| 5.435484 | 0.02 |
| 5.435548 | 0.02 |
| 5.435582 | 0.02 |
| 5.435621 | 0.02 |
| 5.435661 | 0.02 |
| 5.435692 | 0.02 |
| 5.435739 | 0.02 |
| 5.435774 | 0.02 |
| 5.43581 | 0.02 |
| 5.435847 | 0.02 |
| 5.43589 | 0.02 |
| 5.435942 | 0.02 |
| 5.435967 | 0.02 |
| 5.436017 | 0.02 |
| 5.436048 | 0.02 |
| 5.436076 | 0.02 |
| 5.436114 | 0.02 |
| 5.436144 | 0.02 |
| 5.436164 | 0.02 |
| 5.436188 | 0.02 |
| 5.43622 | 0.02 |
| 5.436248 | 0.02 |
| 5.436288 | 0.02 |
| 5.436326 | 0.02 |
| 5.436359 | 0.02 |
| 5.436386 | 0.02 |
| 5.436421 | 0.02 |
| 5.436446 | 0.02 |
| 5.436473 | 0.02 |
| 5.43652 | 0.02 |
| 5.436553 | 0.02 |
| 5.436587 | 0.02 |
| 5.43662 | 0.02 |
| 5.436647 | 0.02 |